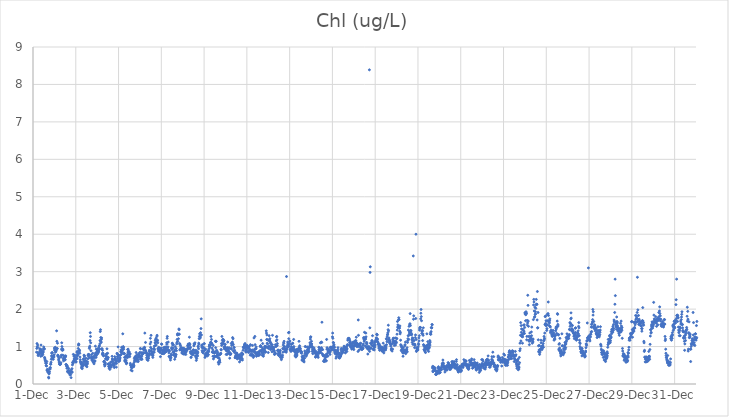
| Category | Chl (ug/L) |
|---|---|
| 44896.166666666664 | 0.85 |
| 44896.177083333336 | 0.95 |
| 44896.1875 | 1.08 |
| 44896.197916666664 | 0.99 |
| 44896.208333333336 | 0.98 |
| 44896.21875 | 1.04 |
| 44896.229166666664 | 0.84 |
| 44896.239583333336 | 0.76 |
| 44896.25 | 0.78 |
| 44896.260416666664 | 0.79 |
| 44896.270833333336 | 0.82 |
| 44896.28125 | 0.81 |
| 44896.291666666664 | 0.8 |
| 44896.302083333336 | 0.84 |
| 44896.3125 | 0.94 |
| 44896.322916666664 | 0.82 |
| 44896.333333333336 | 0.89 |
| 44896.34375 | 0.92 |
| 44896.354166666664 | 0.93 |
| 44896.364583333336 | 0.74 |
| 44896.375 | 1.04 |
| 44896.385416666664 | 0.86 |
| 44896.395833333336 | 0.9 |
| 44896.40625 | 0.8 |
| 44896.416666666664 | 0.8 |
| 44896.427083333336 | 0.76 |
| 44896.4375 | 0.85 |
| 44896.447916666664 | 0.83 |
| 44896.458333333336 | 0.79 |
| 44896.46875 | 0.87 |
| 44896.479166666664 | 0.85 |
| 44896.489583333336 | 0.93 |
| 44896.5 | 0.99 |
| 44896.510416666664 | 0.95 |
| 44896.520833333336 | 0.95 |
| 44896.53125 | 0.93 |
| 44896.541666666664 | 0.71 |
| 44896.552083333336 | 0.69 |
| 44896.5625 | 0.66 |
| 44896.572916666664 | 0.63 |
| 44896.583333333336 | 0.61 |
| 44896.59375 | 0.56 |
| 44896.604166666664 | 0.56 |
| 44896.614583333336 | 0.49 |
| 44896.625 | 0.55 |
| 44896.635416666664 | 0.48 |
| 44896.645833333336 | 0.6 |
| 44896.65625 | 0.36 |
| 44896.666666666664 | 0.39 |
| 44896.677083333336 | 0.38 |
| 44896.6875 | 0.36 |
| 44896.697916666664 | 0.32 |
| 44896.708333333336 | 0.31 |
| 44896.71875 | 0.34 |
| 44896.729166666664 | 0.18 |
| 44896.739583333336 | 0.16 |
| 44896.75 | 0.27 |
| 44896.760416666664 | 0.29 |
| 44896.770833333336 | 0.33 |
| 44896.78125 | 0.41 |
| 44896.791666666664 | 0.43 |
| 44896.802083333336 | 0.4 |
| 44896.8125 | 0.44 |
| 44896.822916666664 | 0.53 |
| 44896.833333333336 | 0.53 |
| 44896.84375 | 0.58 |
| 44896.854166666664 | 0.66 |
| 44896.864583333336 | 0.75 |
| 44896.875 | 0.83 |
| 44896.885416666664 | 0.82 |
| 44896.895833333336 | 0.71 |
| 44896.90625 | 0.84 |
| 44896.916666666664 | 0.67 |
| 44896.927083333336 | 0.7 |
| 44896.9375 | 0.73 |
| 44896.947916666664 | 0.66 |
| 44896.958333333336 | 0.76 |
| 44896.96875 | 0.74 |
| 44896.979166666664 | 0.72 |
| 44896.989583333336 | 0.78 |
| 44897.0 | 0.96 |
| 44897.010416666664 | 0.9 |
| 44897.020833333336 | 0.93 |
| 44897.03125 | 0.94 |
| 44897.041666666664 | 0.98 |
| 44897.052083333336 | 0.85 |
| 44897.0625 | 0.91 |
| 44897.072916666664 | 0.87 |
| 44897.083333333336 | 0.9 |
| 44897.09375 | 0.95 |
| 44897.104166666664 | 1.42 |
| 44897.114583333336 | 1.14 |
| 44897.125 | 0.94 |
| 44897.135416666664 | 0.95 |
| 44897.145833333336 | 1.09 |
| 44897.15625 | 0.77 |
| 44897.166666666664 | 0.74 |
| 44897.177083333336 | 0.76 |
| 44897.1875 | 0.73 |
| 44897.197916666664 | 0.66 |
| 44897.208333333336 | 0.62 |
| 44897.21875 | 0.69 |
| 44897.229166666664 | 0.58 |
| 44897.239583333336 | 0.53 |
| 44897.25 | 0.54 |
| 44897.260416666664 | 0.53 |
| 44897.270833333336 | 0.52 |
| 44897.28125 | 0.53 |
| 44897.291666666664 | 0.54 |
| 44897.302083333336 | 0.57 |
| 44897.3125 | 0.72 |
| 44897.322916666664 | 0.77 |
| 44897.333333333336 | 0.93 |
| 44897.34375 | 1.1 |
| 44897.354166666664 | 1 |
| 44897.364583333336 | 0.9 |
| 44897.375 | 0.91 |
| 44897.385416666664 | 0.94 |
| 44897.395833333336 | 0.77 |
| 44897.40625 | 0.91 |
| 44897.416666666664 | 0.68 |
| 44897.427083333336 | 0.62 |
| 44897.4375 | 0.66 |
| 44897.447916666664 | 0.71 |
| 44897.458333333336 | 0.74 |
| 44897.46875 | 0.66 |
| 44897.479166666664 | 0.64 |
| 44897.489583333336 | 0.71 |
| 44897.5 | 0.75 |
| 44897.510416666664 | 0.65 |
| 44897.520833333336 | 0.73 |
| 44897.53125 | 0.75 |
| 44897.541666666664 | 0.52 |
| 44897.552083333336 | 0.52 |
| 44897.5625 | 0.51 |
| 44897.572916666664 | 0.47 |
| 44897.583333333336 | 0.42 |
| 44897.59375 | 0.49 |
| 44897.604166666664 | 0.47 |
| 44897.614583333336 | 0.34 |
| 44897.625 | 0.32 |
| 44897.635416666664 | 0.33 |
| 44897.645833333336 | 0.42 |
| 44897.65625 | 0.42 |
| 44897.666666666664 | 0.37 |
| 44897.677083333336 | 0.33 |
| 44897.6875 | 0.33 |
| 44897.697916666664 | 0.28 |
| 44897.708333333336 | 0.32 |
| 44897.71875 | 0.28 |
| 44897.729166666664 | 0.24 |
| 44897.739583333336 | 0.33 |
| 44897.75 | 0.32 |
| 44897.760416666664 | 0.25 |
| 44897.770833333336 | 0.32 |
| 44897.78125 | 0.17 |
| 44897.791666666664 | 0.38 |
| 44897.802083333336 | 0.33 |
| 44897.8125 | 0.31 |
| 44897.822916666664 | 0.41 |
| 44897.833333333336 | 0.32 |
| 44897.84375 | 0.51 |
| 44897.854166666664 | 0.58 |
| 44897.864583333336 | 0.57 |
| 44897.875 | 0.55 |
| 44897.885416666664 | 0.79 |
| 44897.895833333336 | 0.59 |
| 44897.90625 | 0.63 |
| 44897.916666666664 | 0.74 |
| 44897.927083333336 | 0.67 |
| 44897.9375 | 0.63 |
| 44897.947916666664 | 0.67 |
| 44897.958333333336 | 0.77 |
| 44897.96875 | 0.71 |
| 44897.979166666664 | 0.67 |
| 44897.989583333336 | 0.61 |
| 44898.0 | 0.59 |
| 44898.010416666664 | 0.68 |
| 44898.020833333336 | 0.59 |
| 44898.03125 | 0.68 |
| 44898.041666666664 | 0.75 |
| 44898.052083333336 | 0.85 |
| 44898.0625 | 0.68 |
| 44898.072916666664 | 0.87 |
| 44898.083333333336 | 0.79 |
| 44898.09375 | 0.76 |
| 44898.104166666664 | 0.82 |
| 44898.114583333336 | 0.95 |
| 44898.125 | 1.04 |
| 44898.135416666664 | 1.07 |
| 44898.145833333336 | 1.05 |
| 44898.15625 | 0.86 |
| 44898.166666666664 | 0.91 |
| 44898.177083333336 | 0.89 |
| 44898.1875 | 0.82 |
| 44898.197916666664 | 0.72 |
| 44898.208333333336 | 0.65 |
| 44898.21875 | 0.6 |
| 44898.229166666664 | 0.58 |
| 44898.239583333336 | 0.55 |
| 44898.25 | 0.58 |
| 44898.260416666664 | 0.52 |
| 44898.270833333336 | 0.43 |
| 44898.28125 | 0.47 |
| 44898.291666666664 | 0.44 |
| 44898.302083333336 | 0.41 |
| 44898.3125 | 0.49 |
| 44898.322916666664 | 0.48 |
| 44898.333333333336 | 0.56 |
| 44898.34375 | 0.52 |
| 44898.354166666664 | 0.66 |
| 44898.364583333336 | 0.61 |
| 44898.375 | 0.68 |
| 44898.385416666664 | 0.77 |
| 44898.395833333336 | 0.75 |
| 44898.40625 | 0.75 |
| 44898.416666666664 | 0.6 |
| 44898.427083333336 | 0.51 |
| 44898.4375 | 0.55 |
| 44898.447916666664 | 0.63 |
| 44898.458333333336 | 0.61 |
| 44898.46875 | 0.69 |
| 44898.479166666664 | 0.61 |
| 44898.489583333336 | 0.48 |
| 44898.5 | 0.6 |
| 44898.510416666664 | 0.52 |
| 44898.520833333336 | 0.46 |
| 44898.53125 | 0.54 |
| 44898.541666666664 | 0.54 |
| 44898.552083333336 | 0.59 |
| 44898.5625 | 0.67 |
| 44898.572916666664 | 0.76 |
| 44898.583333333336 | 0.79 |
| 44898.59375 | 0.77 |
| 44898.604166666664 | 0.75 |
| 44898.614583333336 | 0.79 |
| 44898.625 | 0.7 |
| 44898.635416666664 | 0.95 |
| 44898.645833333336 | 0.98 |
| 44898.65625 | 1.01 |
| 44898.666666666664 | 1.16 |
| 44898.677083333336 | 1.37 |
| 44898.6875 | 1.27 |
| 44898.697916666664 | 1.1 |
| 44898.708333333336 | 0.89 |
| 44898.71875 | 0.72 |
| 44898.729166666664 | 0.78 |
| 44898.739583333336 | 0.68 |
| 44898.75 | 0.64 |
| 44898.760416666664 | 0.7 |
| 44898.770833333336 | 0.67 |
| 44898.78125 | 0.72 |
| 44898.791666666664 | 0.82 |
| 44898.802083333336 | 0.6 |
| 44898.8125 | 0.71 |
| 44898.822916666664 | 0.58 |
| 44898.833333333336 | 0.62 |
| 44898.84375 | 0.62 |
| 44898.854166666664 | 0.54 |
| 44898.864583333336 | 0.75 |
| 44898.875 | 0.7 |
| 44898.885416666664 | 0.6 |
| 44898.895833333336 | 0.62 |
| 44898.90625 | 0.79 |
| 44898.916666666664 | 1.01 |
| 44898.927083333336 | 0.83 |
| 44898.9375 | 0.78 |
| 44898.947916666664 | 0.71 |
| 44898.958333333336 | 0.93 |
| 44898.96875 | 0.76 |
| 44898.979166666664 | 0.84 |
| 44898.989583333336 | 0.83 |
| 44899.0 | 0.88 |
| 44899.010416666664 | 0.94 |
| 44899.020833333336 | 0.9 |
| 44899.03125 | 0.81 |
| 44899.041666666664 | 0.84 |
| 44899.052083333336 | 0.85 |
| 44899.0625 | 0.87 |
| 44899.072916666664 | 0.88 |
| 44899.083333333336 | 0.96 |
| 44899.09375 | 1.01 |
| 44899.104166666664 | 1.02 |
| 44899.114583333336 | 0.93 |
| 44899.125 | 1.07 |
| 44899.135416666664 | 1.16 |
| 44899.145833333336 | 1.4 |
| 44899.15625 | 1.45 |
| 44899.166666666664 | 1.24 |
| 44899.177083333336 | 1.13 |
| 44899.1875 | 1.11 |
| 44899.197916666664 | 1.19 |
| 44899.208333333336 | 1.23 |
| 44899.21875 | 0.94 |
| 44899.229166666664 | 0.94 |
| 44899.239583333336 | 0.8 |
| 44899.25 | 0.9 |
| 44899.260416666664 | 0.83 |
| 44899.270833333336 | 0.77 |
| 44899.28125 | 0.81 |
| 44899.291666666664 | 0.77 |
| 44899.302083333336 | 0.75 |
| 44899.3125 | 0.59 |
| 44899.322916666664 | 0.6 |
| 44899.333333333336 | 0.61 |
| 44899.34375 | 0.52 |
| 44899.354166666664 | 0.48 |
| 44899.364583333336 | 0.53 |
| 44899.375 | 0.51 |
| 44899.385416666664 | 0.56 |
| 44899.395833333336 | 0.67 |
| 44899.40625 | 0.68 |
| 44899.416666666664 | 0.79 |
| 44899.427083333336 | 0.74 |
| 44899.4375 | 0.74 |
| 44899.447916666664 | 0.81 |
| 44899.458333333336 | 0.94 |
| 44899.46875 | 0.65 |
| 44899.479166666664 | 0.69 |
| 44899.489583333336 | 0.82 |
| 44899.5 | 0.67 |
| 44899.510416666664 | 0.53 |
| 44899.520833333336 | 0.71 |
| 44899.53125 | 0.54 |
| 44899.541666666664 | 0.47 |
| 44899.552083333336 | 0.47 |
| 44899.5625 | 0.42 |
| 44899.572916666664 | 0.44 |
| 44899.583333333336 | 0.46 |
| 44899.59375 | 0.39 |
| 44899.604166666664 | 0.48 |
| 44899.614583333336 | 0.53 |
| 44899.625 | 0.58 |
| 44899.635416666664 | 0.48 |
| 44899.645833333336 | 0.49 |
| 44899.65625 | 0.45 |
| 44899.666666666664 | 0.5 |
| 44899.677083333336 | 0.49 |
| 44899.6875 | 0.6 |
| 44899.697916666664 | 0.74 |
| 44899.708333333336 | 0.67 |
| 44899.71875 | 0.66 |
| 44899.729166666664 | 0.53 |
| 44899.739583333336 | 0.61 |
| 44899.75 | 0.55 |
| 44899.760416666664 | 0.53 |
| 44899.770833333336 | 0.49 |
| 44899.78125 | 0.5 |
| 44899.791666666664 | 0.5 |
| 44899.802083333336 | 0.44 |
| 44899.8125 | 0.55 |
| 44899.822916666664 | 0.73 |
| 44899.833333333336 | 0.66 |
| 44899.84375 | 0.63 |
| 44899.854166666664 | 0.68 |
| 44899.864583333336 | 0.55 |
| 44899.875 | 0.58 |
| 44899.885416666664 | 0.62 |
| 44899.895833333336 | 0.45 |
| 44899.90625 | 0.55 |
| 44899.916666666664 | 0.62 |
| 44899.927083333336 | 0.82 |
| 44899.9375 | 0.8 |
| 44899.947916666664 | 0.73 |
| 44899.958333333336 | 0.67 |
| 44899.96875 | 0.72 |
| 44899.979166666664 | 0.99 |
| 44899.989583333336 | 0.78 |
| 44900.0 | 0.77 |
| 44900.010416666664 | 0.6 |
| 44900.020833333336 | 0.62 |
| 44900.03125 | 0.76 |
| 44900.041666666664 | 0.66 |
| 44900.052083333336 | 0.62 |
| 44900.0625 | 0.67 |
| 44900.072916666664 | 0.7 |
| 44900.083333333336 | 0.77 |
| 44900.09375 | 0.77 |
| 44900.104166666664 | 0.86 |
| 44900.114583333336 | 0.91 |
| 44900.125 | 0.86 |
| 44900.135416666664 | 0.85 |
| 44900.145833333336 | 0.98 |
| 44900.15625 | 0.81 |
| 44900.166666666664 | 0.9 |
| 44900.177083333336 | 0.88 |
| 44900.1875 | 0.96 |
| 44900.197916666664 | 1.34 |
| 44900.208333333336 | 0.97 |
| 44900.21875 | 1 |
| 44900.229166666664 | 0.98 |
| 44900.239583333336 | 0.93 |
| 44900.25 | 0.81 |
| 44900.260416666664 | 0.82 |
| 44900.270833333336 | 0.81 |
| 44900.28125 | 0.71 |
| 44900.291666666664 | 0.62 |
| 44900.302083333336 | 0.61 |
| 44900.3125 | 0.65 |
| 44900.322916666664 | 0.72 |
| 44900.333333333336 | 0.59 |
| 44900.34375 | 0.75 |
| 44900.354166666664 | 0.62 |
| 44900.364583333336 | 0.54 |
| 44900.375 | 0.56 |
| 44900.385416666664 | 0.56 |
| 44900.395833333336 | 0.74 |
| 44900.40625 | 0.7 |
| 44900.416666666664 | 0.79 |
| 44900.427083333336 | 0.92 |
| 44900.4375 | 0.85 |
| 44900.447916666664 | 0.93 |
| 44900.458333333336 | 0.73 |
| 44900.46875 | 0.85 |
| 44900.479166666664 | 0.87 |
| 44900.489583333336 | 0.86 |
| 44900.5 | 0.82 |
| 44900.510416666664 | 0.78 |
| 44900.520833333336 | 0.73 |
| 44900.53125 | 0.81 |
| 44900.541666666664 | 0.8 |
| 44900.552083333336 | 0.55 |
| 44900.5625 | 0.51 |
| 44900.572916666664 | 0.49 |
| 44900.583333333336 | 0.37 |
| 44900.59375 | 0.45 |
| 44900.604166666664 | 0.48 |
| 44900.614583333336 | 0.43 |
| 44900.625 | 0.44 |
| 44900.635416666664 | 0.35 |
| 44900.645833333336 | 0.49 |
| 44900.65625 | 0.47 |
| 44900.666666666664 | 0.48 |
| 44900.677083333336 | 0.48 |
| 44900.6875 | 0.52 |
| 44900.697916666664 | 0.53 |
| 44900.708333333336 | 0.46 |
| 44900.71875 | 0.49 |
| 44900.729166666664 | 0.58 |
| 44900.739583333336 | 0.68 |
| 44900.75 | 0.63 |
| 44900.760416666664 | 0.71 |
| 44900.770833333336 | 0.72 |
| 44900.78125 | 0.72 |
| 44900.791666666664 | 0.65 |
| 44900.802083333336 | 0.62 |
| 44900.8125 | 0.75 |
| 44900.822916666664 | 0.84 |
| 44900.833333333336 | 0.68 |
| 44900.84375 | 0.61 |
| 44900.854166666664 | 0.7 |
| 44900.864583333336 | 0.69 |
| 44900.875 | 0.78 |
| 44900.885416666664 | 0.66 |
| 44900.895833333336 | 0.63 |
| 44900.90625 | 0.61 |
| 44900.916666666664 | 0.6 |
| 44900.927083333336 | 0.72 |
| 44900.9375 | 0.74 |
| 44900.947916666664 | 0.72 |
| 44900.958333333336 | 0.81 |
| 44900.96875 | 0.76 |
| 44900.979166666664 | 0.77 |
| 44900.989583333336 | 0.84 |
| 44901.0 | 0.74 |
| 44901.010416666664 | 0.66 |
| 44901.020833333336 | 0.95 |
| 44901.03125 | 0.94 |
| 44901.041666666664 | 0.7 |
| 44901.052083333336 | 0.84 |
| 44901.0625 | 0.69 |
| 44901.072916666664 | 0.66 |
| 44901.083333333336 | 0.74 |
| 44901.09375 | 0.66 |
| 44901.104166666664 | 0.79 |
| 44901.114583333336 | 0.79 |
| 44901.125 | 0.81 |
| 44901.135416666664 | 0.94 |
| 44901.145833333336 | 0.84 |
| 44901.15625 | 0.82 |
| 44901.166666666664 | 0.93 |
| 44901.177083333336 | 0.92 |
| 44901.1875 | 0.94 |
| 44901.197916666664 | 0.91 |
| 44901.208333333336 | 0.98 |
| 44901.21875 | 0.97 |
| 44901.229166666664 | 1.36 |
| 44901.239583333336 | 0.83 |
| 44901.25 | 0.91 |
| 44901.260416666664 | 1.11 |
| 44901.270833333336 | 0.88 |
| 44901.28125 | 0.86 |
| 44901.291666666664 | 0.83 |
| 44901.302083333336 | 0.83 |
| 44901.3125 | 0.7 |
| 44901.322916666664 | 0.77 |
| 44901.333333333336 | 0.65 |
| 44901.34375 | 0.76 |
| 44901.354166666664 | 0.8 |
| 44901.364583333336 | 0.72 |
| 44901.375 | 0.63 |
| 44901.385416666664 | 0.76 |
| 44901.395833333336 | 0.68 |
| 44901.40625 | 0.69 |
| 44901.416666666664 | 0.75 |
| 44901.427083333336 | 0.81 |
| 44901.4375 | 0.9 |
| 44901.447916666664 | 0.86 |
| 44901.458333333336 | 0.87 |
| 44901.46875 | 0.79 |
| 44901.479166666664 | 1.07 |
| 44901.489583333336 | 1.22 |
| 44901.5 | 0.98 |
| 44901.510416666664 | 1.12 |
| 44901.520833333336 | 1.3 |
| 44901.53125 | 0.89 |
| 44901.541666666664 | 0.94 |
| 44901.552083333336 | 0.81 |
| 44901.5625 | 0.82 |
| 44901.572916666664 | 0.85 |
| 44901.583333333336 | 0.76 |
| 44901.59375 | 0.78 |
| 44901.604166666664 | 0.71 |
| 44901.614583333336 | 0.77 |
| 44901.625 | 0.85 |
| 44901.635416666664 | 0.85 |
| 44901.645833333336 | 0.93 |
| 44901.65625 | 0.95 |
| 44901.666666666664 | 0.85 |
| 44901.677083333336 | 1.01 |
| 44901.6875 | 0.92 |
| 44901.697916666664 | 1.02 |
| 44901.708333333336 | 1.1 |
| 44901.71875 | 1.16 |
| 44901.729166666664 | 1.1 |
| 44901.739583333336 | 1.19 |
| 44901.75 | 1.22 |
| 44901.760416666664 | 1.04 |
| 44901.770833333336 | 1.15 |
| 44901.78125 | 1.14 |
| 44901.791666666664 | 1.27 |
| 44901.802083333336 | 1.3 |
| 44901.8125 | 1.15 |
| 44901.822916666664 | 1.17 |
| 44901.833333333336 | 1.1 |
| 44901.84375 | 0.94 |
| 44901.854166666664 | 0.94 |
| 44901.864583333336 | 0.88 |
| 44901.875 | 0.98 |
| 44901.885416666664 | 0.92 |
| 44901.895833333336 | 0.9 |
| 44901.90625 | 0.96 |
| 44901.916666666664 | 0.88 |
| 44901.927083333336 | 0.86 |
| 44901.9375 | 0.86 |
| 44901.947916666664 | 0.84 |
| 44901.958333333336 | 0.73 |
| 44901.96875 | 0.94 |
| 44901.979166666664 | 0.9 |
| 44901.989583333336 | 0.96 |
| 44902.0 | 0.92 |
| 44902.010416666664 | 1.07 |
| 44902.020833333336 | 1.06 |
| 44902.03125 | 0.81 |
| 44902.041666666664 | 0.9 |
| 44902.052083333336 | 0.82 |
| 44902.0625 | 0.82 |
| 44902.072916666664 | 0.87 |
| 44902.083333333336 | 0.89 |
| 44902.09375 | 0.9 |
| 44902.104166666664 | 0.97 |
| 44902.114583333336 | 0.81 |
| 44902.125 | 0.92 |
| 44902.135416666664 | 0.89 |
| 44902.145833333336 | 0.83 |
| 44902.15625 | 0.98 |
| 44902.166666666664 | 0.85 |
| 44902.177083333336 | 0.92 |
| 44902.1875 | 0.95 |
| 44902.197916666664 | 0.98 |
| 44902.208333333336 | 0.86 |
| 44902.21875 | 0.99 |
| 44902.229166666664 | 0.92 |
| 44902.239583333336 | 0.87 |
| 44902.25 | 1.1 |
| 44902.260416666664 | 1.06 |
| 44902.270833333336 | 1.22 |
| 44902.28125 | 1.27 |
| 44902.291666666664 | 0.97 |
| 44902.302083333336 | 0.91 |
| 44902.3125 | 0.99 |
| 44902.322916666664 | 1.12 |
| 44902.333333333336 | 0.91 |
| 44902.34375 | 0.9 |
| 44902.354166666664 | 0.83 |
| 44902.364583333336 | 0.74 |
| 44902.375 | 0.73 |
| 44902.385416666664 | 0.88 |
| 44902.395833333336 | 0.73 |
| 44902.40625 | 0.73 |
| 44902.416666666664 | 0.69 |
| 44902.427083333336 | 0.64 |
| 44902.4375 | 0.71 |
| 44902.447916666664 | 0.7 |
| 44902.458333333336 | 0.8 |
| 44902.46875 | 0.77 |
| 44902.479166666664 | 0.95 |
| 44902.489583333336 | 0.97 |
| 44902.5 | 0.92 |
| 44902.510416666664 | 1.09 |
| 44902.520833333336 | 1.08 |
| 44902.53125 | 1.04 |
| 44902.541666666664 | 0.85 |
| 44902.552083333336 | 0.96 |
| 44902.5625 | 1.05 |
| 44902.572916666664 | 0.77 |
| 44902.583333333336 | 0.79 |
| 44902.59375 | 0.86 |
| 44902.604166666664 | 0.87 |
| 44902.614583333336 | 0.81 |
| 44902.625 | 0.66 |
| 44902.635416666664 | 0.91 |
| 44902.645833333336 | 1 |
| 44902.65625 | 0.72 |
| 44902.666666666664 | 0.74 |
| 44902.677083333336 | 0.79 |
| 44902.6875 | 0.78 |
| 44902.697916666664 | 0.95 |
| 44902.708333333336 | 0.89 |
| 44902.71875 | 1.07 |
| 44902.729166666664 | 1.11 |
| 44902.739583333336 | 1.19 |
| 44902.75 | 1.31 |
| 44902.760416666664 | 1.34 |
| 44902.770833333336 | 1.14 |
| 44902.78125 | 1.33 |
| 44902.791666666664 | 1.32 |
| 44902.802083333336 | 1.21 |
| 44902.8125 | 1.33 |
| 44902.822916666664 | 1.47 |
| 44902.833333333336 | 1.45 |
| 44902.84375 | 1.33 |
| 44902.854166666664 | 1.08 |
| 44902.864583333336 | 0.91 |
| 44902.875 | 1.06 |
| 44902.885416666664 | 0.92 |
| 44902.895833333336 | 1.02 |
| 44902.90625 | 0.96 |
| 44902.916666666664 | 0.94 |
| 44902.927083333336 | 0.91 |
| 44902.9375 | 0.97 |
| 44902.947916666664 | 0.9 |
| 44902.958333333336 | 0.83 |
| 44902.96875 | 0.89 |
| 44902.979166666664 | 0.95 |
| 44902.989583333336 | 0.82 |
| 44903.0 | 0.88 |
| 44903.010416666664 | 0.96 |
| 44903.020833333336 | 0.92 |
| 44903.03125 | 0.8 |
| 44903.041666666664 | 0.9 |
| 44903.052083333336 | 0.89 |
| 44903.0625 | 0.95 |
| 44903.072916666664 | 0.87 |
| 44903.083333333336 | 0.8 |
| 44903.09375 | 0.85 |
| 44903.104166666664 | 0.91 |
| 44903.114583333336 | 0.87 |
| 44903.125 | 0.84 |
| 44903.135416666664 | 0.87 |
| 44903.145833333336 | 0.79 |
| 44903.15625 | 0.93 |
| 44903.166666666664 | 0.86 |
| 44903.177083333336 | 0.91 |
| 44903.1875 | 0.91 |
| 44903.197916666664 | 0.92 |
| 44903.208333333336 | 0.91 |
| 44903.21875 | 0.93 |
| 44903.229166666664 | 1.03 |
| 44903.239583333336 | 0.96 |
| 44903.25 | 1 |
| 44903.260416666664 | 1.07 |
| 44903.270833333336 | 1.04 |
| 44903.28125 | 0.96 |
| 44903.291666666664 | 0.97 |
| 44903.302083333336 | 1.04 |
| 44903.3125 | 1.25 |
| 44903.322916666664 | 1.08 |
| 44903.333333333336 | 1.05 |
| 44903.34375 | 0.94 |
| 44903.354166666664 | 0.86 |
| 44903.364583333336 | 0.98 |
| 44903.375 | 0.82 |
| 44903.385416666664 | 0.71 |
| 44903.395833333336 | 0.72 |
| 44903.40625 | 0.87 |
| 44903.416666666664 | 0.82 |
| 44903.427083333336 | 0.85 |
| 44903.4375 | 0.79 |
| 44903.447916666664 | 0.84 |
| 44903.458333333336 | 0.82 |
| 44903.46875 | 0.82 |
| 44903.479166666664 | 0.78 |
| 44903.489583333336 | 0.91 |
| 44903.5 | 0.89 |
| 44903.510416666664 | 0.91 |
| 44903.520833333336 | 1.02 |
| 44903.53125 | 1.07 |
| 44903.541666666664 | 1.07 |
| 44903.552083333336 | 1.06 |
| 44903.5625 | 0.83 |
| 44903.572916666664 | 1.1 |
| 44903.583333333336 | 0.85 |
| 44903.59375 | 0.75 |
| 44903.604166666664 | 0.83 |
| 44903.614583333336 | 0.9 |
| 44903.625 | 0.71 |
| 44903.635416666664 | 0.63 |
| 44903.645833333336 | 0.75 |
| 44903.65625 | 0.68 |
| 44903.666666666664 | 0.87 |
| 44903.677083333336 | 0.8 |
| 44903.6875 | 0.82 |
| 44903.697916666664 | 0.75 |
| 44903.708333333336 | 0.85 |
| 44903.71875 | 1.01 |
| 44903.729166666664 | 0.99 |
| 44903.739583333336 | 0.94 |
| 44903.75 | 1.09 |
| 44903.760416666664 | 1.06 |
| 44903.770833333336 | 1.21 |
| 44903.78125 | 1.27 |
| 44903.791666666664 | 1.34 |
| 44903.802083333336 | 1.22 |
| 44903.8125 | 1.27 |
| 44903.822916666664 | 1.24 |
| 44903.833333333336 | 1.37 |
| 44903.84375 | 1.31 |
| 44903.854166666664 | 1.48 |
| 44903.864583333336 | 1.74 |
| 44903.875 | 1.31 |
| 44903.885416666664 | 1.02 |
| 44903.895833333336 | 0.98 |
| 44903.90625 | 0.89 |
| 44903.916666666664 | 1.05 |
| 44903.927083333336 | 0.85 |
| 44903.9375 | 0.96 |
| 44903.947916666664 | 0.88 |
| 44903.958333333336 | 0.83 |
| 44903.96875 | 0.98 |
| 44903.979166666664 | 0.96 |
| 44903.989583333336 | 0.88 |
| 44904.0 | 1.07 |
| 44904.010416666664 | 1.08 |
| 44904.020833333336 | 0.95 |
| 44904.03125 | 0.9 |
| 44904.041666666664 | 0.71 |
| 44904.052083333336 | 0.79 |
| 44904.0625 | 0.75 |
| 44904.072916666664 | 0.93 |
| 44904.083333333336 | 0.82 |
| 44904.09375 | 0.79 |
| 44904.104166666664 | 0.76 |
| 44904.114583333336 | 0.77 |
| 44904.125 | 0.78 |
| 44904.135416666664 | 0.82 |
| 44904.145833333336 | 0.85 |
| 44904.15625 | 0.75 |
| 44904.166666666664 | 0.8 |
| 44904.177083333336 | 0.89 |
| 44904.1875 | 0.79 |
| 44904.197916666664 | 0.78 |
| 44904.208333333336 | 0.86 |
| 44904.21875 | 0.88 |
| 44904.229166666664 | 0.94 |
| 44904.239583333336 | 1.01 |
| 44904.25 | 1.05 |
| 44904.260416666664 | 1.01 |
| 44904.270833333336 | 0.98 |
| 44904.28125 | 1.03 |
| 44904.291666666664 | 1.04 |
| 44904.302083333336 | 1.11 |
| 44904.3125 | 1.11 |
| 44904.322916666664 | 1.27 |
| 44904.333333333336 | 1.1 |
| 44904.34375 | 1.19 |
| 44904.354166666664 | 1.08 |
| 44904.364583333336 | 1.07 |
| 44904.375 | 0.96 |
| 44904.385416666664 | 0.85 |
| 44904.395833333336 | 0.85 |
| 44904.40625 | 0.91 |
| 44904.416666666664 | 0.74 |
| 44904.427083333336 | 1.03 |
| 44904.4375 | 0.67 |
| 44904.447916666664 | 0.84 |
| 44904.458333333336 | 0.86 |
| 44904.46875 | 0.74 |
| 44904.479166666664 | 0.82 |
| 44904.489583333336 | 0.72 |
| 44904.5 | 0.85 |
| 44904.510416666664 | 0.74 |
| 44904.520833333336 | 0.85 |
| 44904.53125 | 1.14 |
| 44904.541666666664 | 0.97 |
| 44904.552083333336 | 1.14 |
| 44904.5625 | 1.14 |
| 44904.572916666664 | 0.75 |
| 44904.583333333336 | 0.9 |
| 44904.59375 | 0.73 |
| 44904.604166666664 | 0.88 |
| 44904.614583333336 | 0.82 |
| 44904.625 | 0.79 |
| 44904.635416666664 | 0.76 |
| 44904.645833333336 | 0.84 |
| 44904.65625 | 0.7 |
| 44904.666666666664 | 0.58 |
| 44904.677083333336 | 0.57 |
| 44904.6875 | 0.53 |
| 44904.697916666664 | 0.77 |
| 44904.708333333336 | 0.69 |
| 44904.71875 | 0.62 |
| 44904.729166666664 | 0.64 |
| 44904.739583333336 | 0.58 |
| 44904.75 | 0.79 |
| 44904.760416666664 | 0.8 |
| 44904.770833333336 | 0.81 |
| 44904.78125 | 0.82 |
| 44904.791666666664 | 0.92 |
| 44904.802083333336 | 0.91 |
| 44904.8125 | 1.08 |
| 44904.822916666664 | 1.03 |
| 44904.833333333336 | 1.27 |
| 44904.84375 | 1.07 |
| 44904.854166666664 | 1.16 |
| 44904.864583333336 | 1.08 |
| 44904.875 | 1.19 |
| 44904.885416666664 | 1.09 |
| 44904.895833333336 | 1.19 |
| 44904.90625 | 1.13 |
| 44904.916666666664 | 1.07 |
| 44904.927083333336 | 1.16 |
| 44904.9375 | 0.97 |
| 44904.947916666664 | 0.94 |
| 44904.958333333336 | 0.99 |
| 44904.96875 | 0.99 |
| 44904.979166666664 | 1 |
| 44904.989583333336 | 1.06 |
| 44905.0 | 0.93 |
| 44905.010416666664 | 0.92 |
| 44905.020833333336 | 0.95 |
| 44905.03125 | 0.79 |
| 44905.041666666664 | 0.92 |
| 44905.052083333336 | 0.88 |
| 44905.0625 | 0.89 |
| 44905.072916666664 | 0.79 |
| 44905.083333333336 | 0.95 |
| 44905.09375 | 0.97 |
| 44905.104166666664 | 1.12 |
| 44905.114583333336 | 0.94 |
| 44905.125 | 0.82 |
| 44905.135416666664 | 0.89 |
| 44905.145833333336 | 0.92 |
| 44905.15625 | 0.83 |
| 44905.166666666664 | 0.97 |
| 44905.177083333336 | 0.83 |
| 44905.1875 | 0.85 |
| 44905.197916666664 | 0.69 |
| 44905.208333333336 | 0.79 |
| 44905.21875 | 0.82 |
| 44905.229166666664 | 0.8 |
| 44905.239583333336 | 0.79 |
| 44905.25 | 0.81 |
| 44905.260416666664 | 0.95 |
| 44905.270833333336 | 1.08 |
| 44905.28125 | 0.93 |
| 44905.291666666664 | 1.03 |
| 44905.302083333336 | 1.1 |
| 44905.3125 | 1.08 |
| 44905.322916666664 | 1.12 |
| 44905.333333333336 | 1.24 |
| 44905.34375 | 1.07 |
| 44905.354166666664 | 1.21 |
| 44905.364583333336 | 1.05 |
| 44905.375 | 0.89 |
| 44905.385416666664 | 0.87 |
| 44905.395833333336 | 0.98 |
| 44905.40625 | 0.97 |
| 44905.416666666664 | 0.87 |
| 44905.427083333336 | 0.9 |
| 44905.4375 | 0.83 |
| 44905.447916666664 | 0.7 |
| 44905.458333333336 | 0.72 |
| 44905.46875 | 0.71 |
| 44905.479166666664 | 0.76 |
| 44905.489583333336 | 0.73 |
| 44905.5 | 0.75 |
| 44905.510416666664 | 0.8 |
| 44905.520833333336 | 0.83 |
| 44905.53125 | 0.76 |
| 44905.541666666664 | 0.81 |
| 44905.552083333336 | 0.67 |
| 44905.5625 | 0.7 |
| 44905.572916666664 | 0.7 |
| 44905.583333333336 | 0.76 |
| 44905.59375 | 0.75 |
| 44905.604166666664 | 0.72 |
| 44905.614583333336 | 0.75 |
| 44905.625 | 0.71 |
| 44905.635416666664 | 0.77 |
| 44905.645833333336 | 0.68 |
| 44905.65625 | 0.59 |
| 44905.666666666664 | 0.78 |
| 44905.677083333336 | 0.75 |
| 44905.6875 | 0.7 |
| 44905.697916666664 | 0.7 |
| 44905.708333333336 | 0.64 |
| 44905.71875 | 0.7 |
| 44905.729166666664 | 0.72 |
| 44905.739583333336 | 0.74 |
| 44905.75 | 0.81 |
| 44905.760416666664 | 0.83 |
| 44905.770833333336 | 0.77 |
| 44905.78125 | 0.68 |
| 44905.791666666664 | 0.64 |
| 44905.802083333336 | 0.8 |
| 44905.8125 | 0.8 |
| 44905.822916666664 | 0.9 |
| 44905.833333333336 | 0.97 |
| 44905.84375 | 0.98 |
| 44905.854166666664 | 0.99 |
| 44905.864583333336 | 1 |
| 44905.875 | 0.97 |
| 44905.885416666664 | 1.04 |
| 44905.895833333336 | 1.06 |
| 44905.90625 | 0.97 |
| 44905.916666666664 | 1.08 |
| 44905.927083333336 | 1.01 |
| 44905.9375 | 0.88 |
| 44905.947916666664 | 0.92 |
| 44905.958333333336 | 0.85 |
| 44905.96875 | 0.99 |
| 44905.979166666664 | 0.92 |
| 44905.989583333336 | 0.99 |
| 44906.0 | 1.02 |
| 44906.010416666664 | 1.03 |
| 44906.020833333336 | 0.98 |
| 44906.03125 | 0.98 |
| 44906.041666666664 | 0.87 |
| 44906.052083333336 | 0.99 |
| 44906.0625 | 0.95 |
| 44906.072916666664 | 0.97 |
| 44906.083333333336 | 0.84 |
| 44906.09375 | 0.99 |
| 44906.104166666664 | 0.96 |
| 44906.114583333336 | 1.01 |
| 44906.125 | 0.89 |
| 44906.135416666664 | 0.88 |
| 44906.145833333336 | 0.92 |
| 44906.15625 | 0.77 |
| 44906.166666666664 | 1.05 |
| 44906.177083333336 | 0.88 |
| 44906.1875 | 0.8 |
| 44906.197916666664 | 0.88 |
| 44906.208333333336 | 0.89 |
| 44906.21875 | 0.87 |
| 44906.229166666664 | 0.76 |
| 44906.239583333336 | 0.78 |
| 44906.25 | 0.91 |
| 44906.260416666664 | 1.03 |
| 44906.270833333336 | 0.79 |
| 44906.28125 | 0.87 |
| 44906.291666666664 | 0.88 |
| 44906.302083333336 | 0.71 |
| 44906.3125 | 0.75 |
| 44906.322916666664 | 0.75 |
| 44906.333333333336 | 1.23 |
| 44906.34375 | 0.86 |
| 44906.354166666664 | 0.91 |
| 44906.364583333336 | 0.93 |
| 44906.375 | 1.27 |
| 44906.385416666664 | 1.05 |
| 44906.395833333336 | 0.85 |
| 44906.40625 | 0.81 |
| 44906.416666666664 | 0.95 |
| 44906.427083333336 | 0.94 |
| 44906.4375 | 0.99 |
| 44906.447916666664 | 0.74 |
| 44906.458333333336 | 0.77 |
| 44906.46875 | 0.79 |
| 44906.479166666664 | 0.84 |
| 44906.489583333336 | 0.82 |
| 44906.5 | 0.78 |
| 44906.510416666664 | 0.83 |
| 44906.520833333336 | 0.79 |
| 44906.53125 | 0.76 |
| 44906.541666666664 | 0.83 |
| 44906.552083333336 | 0.78 |
| 44906.5625 | 0.86 |
| 44906.572916666664 | 0.77 |
| 44906.583333333336 | 0.78 |
| 44906.59375 | 0.8 |
| 44906.604166666664 | 0.87 |
| 44906.614583333336 | 0.89 |
| 44906.625 | 1 |
| 44906.635416666664 | 1.02 |
| 44906.645833333336 | 1.02 |
| 44906.65625 | 1 |
| 44906.666666666664 | 1.17 |
| 44906.677083333336 | 0.9 |
| 44906.6875 | 0.86 |
| 44906.697916666664 | 0.9 |
| 44906.708333333336 | 0.83 |
| 44906.71875 | 0.77 |
| 44906.729166666664 | 0.96 |
| 44906.739583333336 | 1.08 |
| 44906.75 | 0.91 |
| 44906.760416666664 | 0.76 |
| 44906.770833333336 | 0.74 |
| 44906.78125 | 0.8 |
| 44906.791666666664 | 0.85 |
| 44906.802083333336 | 0.88 |
| 44906.8125 | 0.94 |
| 44906.822916666664 | 0.91 |
| 44906.833333333336 | 0.99 |
| 44906.84375 | 1.01 |
| 44906.854166666664 | 0.86 |
| 44906.864583333336 | 0.87 |
| 44906.875 | 0.85 |
| 44906.885416666664 | 0.97 |
| 44906.895833333336 | 1 |
| 44906.90625 | 1.42 |
| 44906.916666666664 | 1.36 |
| 44906.927083333336 | 1.19 |
| 44906.9375 | 1.31 |
| 44906.947916666664 | 1.09 |
| 44906.958333333336 | 1.18 |
| 44906.96875 | 1.07 |
| 44906.979166666664 | 0.99 |
| 44906.989583333336 | 0.97 |
| 44907.0 | 0.84 |
| 44907.010416666664 | 0.95 |
| 44907.020833333336 | 1 |
| 44907.03125 | 1.16 |
| 44907.041666666664 | 1.29 |
| 44907.052083333336 | 1.17 |
| 44907.0625 | 1.01 |
| 44907.072916666664 | 1.21 |
| 44907.083333333336 | 1.14 |
| 44907.09375 | 1.1 |
| 44907.104166666664 | 0.92 |
| 44907.114583333336 | 1.1 |
| 44907.125 | 0.96 |
| 44907.135416666664 | 0.93 |
| 44907.145833333336 | 1.05 |
| 44907.15625 | 0.97 |
| 44907.166666666664 | 1 |
| 44907.177083333336 | 0.86 |
| 44907.1875 | 1.05 |
| 44907.197916666664 | 1.3 |
| 44907.208333333336 | 0.93 |
| 44907.21875 | 0.98 |
| 44907.229166666664 | 0.98 |
| 44907.239583333336 | 0.94 |
| 44907.25 | 0.91 |
| 44907.260416666664 | 0.97 |
| 44907.270833333336 | 0.87 |
| 44907.28125 | 0.89 |
| 44907.291666666664 | 0.79 |
| 44907.302083333336 | 0.8 |
| 44907.3125 | 0.83 |
| 44907.322916666664 | 0.82 |
| 44907.333333333336 | 1.05 |
| 44907.34375 | 0.81 |
| 44907.354166666664 | 1.01 |
| 44907.364583333336 | 1 |
| 44907.375 | 1.15 |
| 44907.385416666664 | 1.26 |
| 44907.395833333336 | 1.27 |
| 44907.40625 | 1.18 |
| 44907.416666666664 | 1.03 |
| 44907.427083333336 | 1.08 |
| 44907.4375 | 0.89 |
| 44907.447916666664 | 0.89 |
| 44907.458333333336 | 0.91 |
| 44907.46875 | 0.8 |
| 44907.479166666664 | 0.77 |
| 44907.489583333336 | 0.83 |
| 44907.5 | 0.76 |
| 44907.510416666664 | 0.84 |
| 44907.520833333336 | 0.87 |
| 44907.53125 | 0.81 |
| 44907.541666666664 | 0.87 |
| 44907.552083333336 | 0.82 |
| 44907.5625 | 0.9 |
| 44907.572916666664 | 0.71 |
| 44907.583333333336 | 0.76 |
| 44907.59375 | 0.71 |
| 44907.604166666664 | 0.73 |
| 44907.614583333336 | 0.65 |
| 44907.625 | 0.73 |
| 44907.635416666664 | 0.75 |
| 44907.645833333336 | 0.74 |
| 44907.65625 | 0.71 |
| 44907.666666666664 | 0.77 |
| 44907.677083333336 | 0.95 |
| 44907.6875 | 0.85 |
| 44907.697916666664 | 1.04 |
| 44907.708333333336 | 0.93 |
| 44907.71875 | 1.1 |
| 44907.729166666664 | 1.09 |
| 44907.739583333336 | 1.14 |
| 44907.75 | 0.99 |
| 44907.760416666664 | 1 |
| 44907.770833333336 | 0.95 |
| 44907.78125 | 0.87 |
| 44907.791666666664 | 0.93 |
| 44907.802083333336 | 0.87 |
| 44907.8125 | 0.93 |
| 44907.822916666664 | 0.89 |
| 44907.833333333336 | 0.85 |
| 44907.84375 | 0.86 |
| 44907.854166666664 | 2.87 |
| 44907.864583333336 | 0.92 |
| 44907.875 | 0.94 |
| 44907.885416666664 | 1.02 |
| 44907.895833333336 | 0.98 |
| 44907.90625 | 1.12 |
| 44907.916666666664 | 1.07 |
| 44907.927083333336 | 1.05 |
| 44907.9375 | 1 |
| 44907.947916666664 | 1.37 |
| 44907.958333333336 | 1.21 |
| 44907.96875 | 1.38 |
| 44907.979166666664 | 1.01 |
| 44907.989583333336 | 1.07 |
| 44908.0 | 1.13 |
| 44908.010416666664 | 1.15 |
| 44908.020833333336 | 0.91 |
| 44908.03125 | 0.91 |
| 44908.041666666664 | 0.95 |
| 44908.052083333336 | 0.9 |
| 44908.0625 | 0.87 |
| 44908.072916666664 | 1.06 |
| 44908.083333333336 | 1 |
| 44908.09375 | 0.92 |
| 44908.104166666664 | 0.94 |
| 44908.114583333336 | 0.9 |
| 44908.125 | 0.96 |
| 44908.135416666664 | 1.08 |
| 44908.145833333336 | 1.09 |
| 44908.15625 | 0.9 |
| 44908.166666666664 | 0.93 |
| 44908.177083333336 | 0.97 |
| 44908.1875 | 1.19 |
| 44908.197916666664 | 1 |
| 44908.208333333336 | 0.89 |
| 44908.21875 | 0.92 |
| 44908.229166666664 | 0.87 |
| 44908.239583333336 | 0.86 |
| 44908.25 | 0.75 |
| 44908.260416666664 | 0.88 |
| 44908.270833333336 | 0.79 |
| 44908.28125 | 0.83 |
| 44908.291666666664 | 0.72 |
| 44908.302083333336 | 0.91 |
| 44908.3125 | 0.92 |
| 44908.322916666664 | 0.75 |
| 44908.333333333336 | 0.76 |
| 44908.34375 | 0.8 |
| 44908.354166666664 | 0.85 |
| 44908.364583333336 | 0.9 |
| 44908.375 | 0.86 |
| 44908.385416666664 | 0.92 |
| 44908.395833333336 | 0.9 |
| 44908.40625 | 0.94 |
| 44908.416666666664 | 0.94 |
| 44908.427083333336 | 0.89 |
| 44908.4375 | 1.14 |
| 44908.447916666664 | 0.98 |
| 44908.458333333336 | 0.93 |
| 44908.46875 | 1.02 |
| 44908.479166666664 | 0.94 |
| 44908.489583333336 | 0.92 |
| 44908.5 | 0.95 |
| 44908.510416666664 | 0.87 |
| 44908.520833333336 | 0.88 |
| 44908.53125 | 0.84 |
| 44908.541666666664 | 0.87 |
| 44908.552083333336 | 0.82 |
| 44908.5625 | 0.85 |
| 44908.572916666664 | 0.64 |
| 44908.583333333336 | 0.73 |
| 44908.59375 | 0.64 |
| 44908.604166666664 | 0.7 |
| 44908.614583333336 | 0.75 |
| 44908.625 | 0.69 |
| 44908.635416666664 | 0.61 |
| 44908.645833333336 | 0.67 |
| 44908.65625 | 0.63 |
| 44908.666666666664 | 0.68 |
| 44908.677083333336 | 0.59 |
| 44908.6875 | 0.76 |
| 44908.697916666664 | 0.69 |
| 44908.708333333336 | 0.88 |
| 44908.71875 | 0.82 |
| 44908.729166666664 | 1 |
| 44908.739583333336 | 1 |
| 44908.75 | 0.82 |
| 44908.760416666664 | 0.82 |
| 44908.770833333336 | 0.74 |
| 44908.78125 | 0.82 |
| 44908.791666666664 | 0.81 |
| 44908.802083333336 | 0.78 |
| 44908.8125 | 0.86 |
| 44908.822916666664 | 0.99 |
| 44908.833333333336 | 0.92 |
| 44908.84375 | 0.9 |
| 44908.854166666664 | 0.89 |
| 44908.864583333336 | 0.84 |
| 44908.875 | 0.95 |
| 44908.885416666664 | 0.92 |
| 44908.895833333336 | 0.96 |
| 44908.90625 | 0.87 |
| 44908.916666666664 | 0.97 |
| 44908.927083333336 | 0.98 |
| 44908.9375 | 1.01 |
| 44908.947916666664 | 1.1 |
| 44908.958333333336 | 1.04 |
| 44908.96875 | 1.2 |
| 44908.979166666664 | 1.25 |
| 44908.989583333336 | 1.26 |
| 44909.0 | 1.02 |
| 44909.010416666664 | 1.07 |
| 44909.020833333336 | 1.14 |
| 44909.03125 | 1.07 |
| 44909.041666666664 | 0.98 |
| 44909.052083333336 | 0.87 |
| 44909.0625 | 1 |
| 44909.072916666664 | 0.93 |
| 44909.083333333336 | 0.81 |
| 44909.09375 | 0.91 |
| 44909.104166666664 | 0.87 |
| 44909.114583333336 | 0.9 |
| 44909.125 | 0.88 |
| 44909.135416666664 | 0.92 |
| 44909.145833333336 | 0.96 |
| 44909.15625 | 0.91 |
| 44909.166666666664 | 0.87 |
| 44909.177083333336 | 0.85 |
| 44909.1875 | 0.82 |
| 44909.197916666664 | 0.85 |
| 44909.208333333336 | 0.72 |
| 44909.21875 | 0.72 |
| 44909.229166666664 | 0.87 |
| 44909.239583333336 | 0.76 |
| 44909.25 | 0.79 |
| 44909.260416666664 | 0.82 |
| 44909.270833333336 | 0.78 |
| 44909.28125 | 0.77 |
| 44909.291666666664 | 0.83 |
| 44909.302083333336 | 0.83 |
| 44909.3125 | 0.74 |
| 44909.322916666664 | 0.75 |
| 44909.333333333336 | 0.71 |
| 44909.34375 | 0.84 |
| 44909.354166666664 | 0.81 |
| 44909.364583333336 | 0.98 |
| 44909.375 | 0.92 |
| 44909.385416666664 | 0.9 |
| 44909.395833333336 | 0.85 |
| 44909.40625 | 0.86 |
| 44909.416666666664 | 0.96 |
| 44909.427083333336 | 0.93 |
| 44909.4375 | 1.1 |
| 44909.447916666664 | 0.84 |
| 44909.458333333336 | 0.89 |
| 44909.46875 | 0.93 |
| 44909.479166666664 | 1.12 |
| 44909.489583333336 | 0.97 |
| 44909.5 | 1.11 |
| 44909.510416666664 | 1.65 |
| 44909.520833333336 | 0.81 |
| 44909.53125 | 0.92 |
| 44909.541666666664 | 0.92 |
| 44909.552083333336 | 0.77 |
| 44909.5625 | 0.78 |
| 44909.572916666664 | 0.75 |
| 44909.583333333336 | 0.61 |
| 44909.59375 | 0.76 |
| 44909.604166666664 | 0.76 |
| 44909.614583333336 | 0.6 |
| 44909.625 | 0.62 |
| 44909.635416666664 | 0.66 |
| 44909.645833333336 | 0.64 |
| 44909.65625 | 0.64 |
| 44909.666666666664 | 0.7 |
| 44909.677083333336 | 0.61 |
| 44909.6875 | 0.75 |
| 44909.697916666664 | 0.72 |
| 44909.708333333336 | 0.79 |
| 44909.71875 | 0.62 |
| 44909.729166666664 | 1.19 |
| 44909.739583333336 | 0.93 |
| 44909.75 | 0.97 |
| 44909.760416666664 | 0.76 |
| 44909.770833333336 | 0.82 |
| 44909.78125 | 0.74 |
| 44909.791666666664 | 0.92 |
| 44909.802083333336 | 0.87 |
| 44909.8125 | 0.86 |
| 44909.822916666664 | 0.93 |
| 44909.833333333336 | 0.9 |
| 44909.84375 | 0.9 |
| 44909.854166666664 | 0.9 |
| 44909.864583333336 | 0.88 |
| 44909.875 | 0.84 |
| 44909.885416666664 | 0.79 |
| 44909.895833333336 | 0.86 |
| 44909.90625 | 0.98 |
| 44909.916666666664 | 0.97 |
| 44909.927083333336 | 0.98 |
| 44909.9375 | 0.98 |
| 44909.947916666664 | 0.97 |
| 44909.958333333336 | 0.91 |
| 44909.96875 | 0.97 |
| 44909.979166666664 | 0.92 |
| 44909.989583333336 | 0.99 |
| 44910.0 | 1.26 |
| 44910.010416666664 | 1.36 |
| 44910.020833333336 | 1.22 |
| 44910.03125 | 0.96 |
| 44910.041666666664 | 1.11 |
| 44910.052083333336 | 1.1 |
| 44910.0625 | 1.02 |
| 44910.072916666664 | 1.05 |
| 44910.083333333336 | 0.89 |
| 44910.09375 | 0.91 |
| 44910.104166666664 | 0.98 |
| 44910.114583333336 | 0.84 |
| 44910.125 | 0.81 |
| 44910.135416666664 | 0.84 |
| 44910.145833333336 | 0.83 |
| 44910.15625 | 0.9 |
| 44910.166666666664 | 0.69 |
| 44910.177083333336 | 0.82 |
| 44910.1875 | 0.74 |
| 44910.197916666664 | 0.82 |
| 44910.208333333336 | 0.8 |
| 44910.21875 | 0.81 |
| 44910.229166666664 | 0.86 |
| 44910.239583333336 | 0.88 |
| 44910.25 | 0.91 |
| 44910.260416666664 | 0.97 |
| 44910.270833333336 | 0.78 |
| 44910.28125 | 0.83 |
| 44910.291666666664 | 0.72 |
| 44910.302083333336 | 0.71 |
| 44910.3125 | 0.72 |
| 44910.322916666664 | 0.82 |
| 44910.333333333336 | 0.69 |
| 44910.34375 | 0.73 |
| 44910.354166666664 | 0.79 |
| 44910.364583333336 | 0.73 |
| 44910.375 | 0.73 |
| 44910.385416666664 | 0.75 |
| 44910.395833333336 | 0.91 |
| 44910.40625 | 0.78 |
| 44910.416666666664 | 0.95 |
| 44910.427083333336 | 0.85 |
| 44910.4375 | 0.86 |
| 44910.447916666664 | 0.82 |
| 44910.458333333336 | 0.85 |
| 44910.46875 | 0.84 |
| 44910.479166666664 | 0.86 |
| 44910.489583333336 | 0.85 |
| 44910.5 | 0.95 |
| 44910.510416666664 | 0.91 |
| 44910.520833333336 | 0.91 |
| 44910.53125 | 0.91 |
| 44910.541666666664 | 1.01 |
| 44910.552083333336 | 0.92 |
| 44910.5625 | 0.99 |
| 44910.572916666664 | 0.91 |
| 44910.583333333336 | 0.97 |
| 44910.59375 | 0.92 |
| 44910.604166666664 | 0.83 |
| 44910.614583333336 | 0.9 |
| 44910.625 | 0.85 |
| 44910.635416666664 | 0.97 |
| 44910.645833333336 | 1 |
| 44910.65625 | 0.99 |
| 44910.666666666664 | 0.93 |
| 44910.677083333336 | 0.87 |
| 44910.6875 | 0.94 |
| 44910.697916666664 | 1.05 |
| 44910.708333333336 | 1.04 |
| 44910.71875 | 1.17 |
| 44910.729166666664 | 1.2 |
| 44910.739583333336 | 1.22 |
| 44910.75 | 1.2 |
| 44910.760416666664 | 1.21 |
| 44910.770833333336 | 1.18 |
| 44910.78125 | 1.22 |
| 44910.791666666664 | 1.19 |
| 44910.802083333336 | 1.1 |
| 44910.8125 | 1.02 |
| 44910.822916666664 | 1.04 |
| 44910.833333333336 | 1.14 |
| 44910.84375 | 1.08 |
| 44910.854166666664 | 0.99 |
| 44910.864583333336 | 1.09 |
| 44910.875 | 0.98 |
| 44910.885416666664 | 0.99 |
| 44910.895833333336 | 1.02 |
| 44910.90625 | 0.93 |
| 44910.916666666664 | 0.95 |
| 44910.927083333336 | 1.07 |
| 44910.9375 | 1.01 |
| 44910.947916666664 | 1.01 |
| 44910.958333333336 | 1.09 |
| 44910.96875 | 1.12 |
| 44910.979166666664 | 0.96 |
| 44910.989583333336 | 1.02 |
| 44911.0 | 0.92 |
| 44911.010416666664 | 1.1 |
| 44911.020833333336 | 1.13 |
| 44911.03125 | 1.01 |
| 44911.041666666664 | 1.03 |
| 44911.052083333336 | 1.06 |
| 44911.0625 | 1.09 |
| 44911.072916666664 | 1.1 |
| 44911.083333333336 | 1.16 |
| 44911.09375 | 1.05 |
| 44911.104166666664 | 1.15 |
| 44911.114583333336 | 1.25 |
| 44911.125 | 1.07 |
| 44911.135416666664 | 1 |
| 44911.145833333336 | 1.09 |
| 44911.15625 | 1.04 |
| 44911.166666666664 | 1.07 |
| 44911.177083333336 | 1.07 |
| 44911.1875 | 1 |
| 44911.197916666664 | 0.87 |
| 44911.208333333336 | 1.71 |
| 44911.21875 | 1.3 |
| 44911.229166666664 | 1.01 |
| 44911.239583333336 | 1.02 |
| 44911.25 | 0.91 |
| 44911.260416666664 | 1.04 |
| 44911.270833333336 | 1.07 |
| 44911.28125 | 1.04 |
| 44911.291666666664 | 1.07 |
| 44911.302083333336 | 1.04 |
| 44911.3125 | 0.98 |
| 44911.322916666664 | 1.09 |
| 44911.333333333336 | 0.94 |
| 44911.34375 | 0.97 |
| 44911.354166666664 | 0.98 |
| 44911.364583333336 | 0.92 |
| 44911.375 | 0.94 |
| 44911.385416666664 | 0.97 |
| 44911.395833333336 | 0.93 |
| 44911.40625 | 0.94 |
| 44911.416666666664 | 0.94 |
| 44911.427083333336 | 1.03 |
| 44911.4375 | 0.96 |
| 44911.447916666664 | 1.07 |
| 44911.458333333336 | 1.24 |
| 44911.46875 | 1.21 |
| 44911.479166666664 | 1.18 |
| 44911.489583333336 | 1.14 |
| 44911.5 | 1.38 |
| 44911.510416666664 | 1.19 |
| 44911.520833333336 | 1.24 |
| 44911.53125 | 1.02 |
| 44911.541666666664 | 1.23 |
| 44911.552083333336 | 1.2 |
| 44911.5625 | 1.36 |
| 44911.572916666664 | 1.26 |
| 44911.583333333336 | 0.98 |
| 44911.59375 | 1.09 |
| 44911.604166666664 | 1.11 |
| 44911.614583333336 | 1.07 |
| 44911.625 | 1 |
| 44911.635416666664 | 0.95 |
| 44911.645833333336 | 0.94 |
| 44911.65625 | 0.8 |
| 44911.666666666664 | 0.98 |
| 44911.677083333336 | 0.99 |
| 44911.6875 | 0.92 |
| 44911.697916666664 | 0.98 |
| 44911.708333333336 | 1 |
| 44911.71875 | 0.95 |
| 44911.729166666664 | 8.39 |
| 44911.739583333336 | 0.87 |
| 44911.75 | 1.5 |
| 44911.760416666664 | 2.98 |
| 44911.770833333336 | 3.13 |
| 44911.78125 | 1.09 |
| 44911.791666666664 | 0.95 |
| 44911.802083333336 | 0.96 |
| 44911.8125 | 1.08 |
| 44911.822916666664 | 1.09 |
| 44911.833333333336 | 1.04 |
| 44911.84375 | 1.16 |
| 44911.854166666664 | 1.14 |
| 44911.864583333336 | 1.15 |
| 44911.875 | 1.29 |
| 44911.885416666664 | 1.11 |
| 44911.895833333336 | 1.01 |
| 44911.90625 | 0.92 |
| 44911.916666666664 | 0.94 |
| 44911.927083333336 | 1.01 |
| 44911.9375 | 1.02 |
| 44911.947916666664 | 1.06 |
| 44911.958333333336 | 0.91 |
| 44911.96875 | 1.02 |
| 44911.979166666664 | 0.98 |
| 44911.989583333336 | 1.11 |
| 44912.0 | 1.04 |
| 44912.010416666664 | 1.13 |
| 44912.020833333336 | 1.17 |
| 44912.03125 | 1.14 |
| 44912.041666666664 | 1.17 |
| 44912.052083333336 | 1.23 |
| 44912.0625 | 1.22 |
| 44912.072916666664 | 1.33 |
| 44912.083333333336 | 1.32 |
| 44912.09375 | 1.31 |
| 44912.104166666664 | 1.14 |
| 44912.114583333336 | 1.2 |
| 44912.125 | 1.12 |
| 44912.135416666664 | 1.06 |
| 44912.145833333336 | 1.09 |
| 44912.15625 | 1.06 |
| 44912.166666666664 | 0.96 |
| 44912.177083333336 | 1.01 |
| 44912.1875 | 1.02 |
| 44912.197916666664 | 1.06 |
| 44912.208333333336 | 0.9 |
| 44912.21875 | 0.91 |
| 44912.229166666664 | 0.98 |
| 44912.239583333336 | 0.92 |
| 44912.25 | 0.99 |
| 44912.260416666664 | 1 |
| 44912.270833333336 | 0.93 |
| 44912.28125 | 0.94 |
| 44912.291666666664 | 0.95 |
| 44912.302083333336 | 0.9 |
| 44912.3125 | 0.94 |
| 44912.322916666664 | 0.88 |
| 44912.333333333336 | 0.98 |
| 44912.34375 | 0.87 |
| 44912.354166666664 | 0.91 |
| 44912.364583333336 | 0.96 |
| 44912.375 | 1.09 |
| 44912.385416666664 | 0.88 |
| 44912.395833333336 | 0.91 |
| 44912.40625 | 0.83 |
| 44912.416666666664 | 0.9 |
| 44912.427083333336 | 0.95 |
| 44912.4375 | 0.94 |
| 44912.447916666664 | 1.01 |
| 44912.458333333336 | 1.02 |
| 44912.46875 | 0.94 |
| 44912.479166666664 | 1.01 |
| 44912.489583333336 | 0.91 |
| 44912.5 | 0.99 |
| 44912.510416666664 | 0.96 |
| 44912.520833333336 | 1.21 |
| 44912.53125 | 1.05 |
| 44912.541666666664 | 1.19 |
| 44912.552083333336 | 1.13 |
| 44912.5625 | 1.26 |
| 44912.572916666664 | 1.31 |
| 44912.583333333336 | 1.33 |
| 44912.59375 | 1.37 |
| 44912.604166666664 | 1.45 |
| 44912.614583333336 | 1.57 |
| 44912.625 | 1.42 |
| 44912.635416666664 | 1.17 |
| 44912.645833333336 | 1.23 |
| 44912.65625 | 1.19 |
| 44912.666666666664 | 1.1 |
| 44912.677083333336 | 1.12 |
| 44912.6875 | 1.15 |
| 44912.697916666664 | 1.13 |
| 44912.708333333336 | 1.08 |
| 44912.71875 | 1.05 |
| 44912.729166666664 | 1.01 |
| 44912.739583333336 | 1.07 |
| 44912.75 | 0.91 |
| 44912.760416666664 | 0.94 |
| 44912.770833333336 | 0.94 |
| 44912.78125 | 0.93 |
| 44912.791666666664 | 0.88 |
| 44912.802083333336 | 1.08 |
| 44912.8125 | 0.93 |
| 44912.822916666664 | 1.18 |
| 44912.833333333336 | 1.12 |
| 44912.84375 | 1.22 |
| 44912.854166666664 | 1.22 |
| 44912.864583333336 | 1.14 |
| 44912.875 | 1.15 |
| 44912.885416666664 | 1.03 |
| 44912.895833333336 | 1.13 |
| 44912.90625 | 1.08 |
| 44912.916666666664 | 1.09 |
| 44912.927083333336 | 1.14 |
| 44912.9375 | 1.23 |
| 44912.947916666664 | 1.04 |
| 44912.958333333336 | 1.14 |
| 44912.96875 | 1.12 |
| 44912.979166666664 | 1.12 |
| 44912.989583333336 | 1.1 |
| 44913.0 | 1.22 |
| 44913.010416666664 | 1.21 |
| 44913.020833333336 | 1.33 |
| 44913.03125 | 1.44 |
| 44913.041666666664 | 1.67 |
| 44913.052083333336 | 1.52 |
| 44913.0625 | 1.58 |
| 44913.072916666664 | 1.5 |
| 44913.083333333336 | 1.54 |
| 44913.09375 | 1.72 |
| 44913.104166666664 | 1.77 |
| 44913.114583333336 | 1.72 |
| 44913.125 | 1.5 |
| 44913.135416666664 | 1.49 |
| 44913.145833333336 | 1.41 |
| 44913.15625 | 1.55 |
| 44913.166666666664 | 1.34 |
| 44913.177083333336 | 1.38 |
| 44913.1875 | 1.17 |
| 44913.197916666664 | 1.05 |
| 44913.208333333336 | 1.03 |
| 44913.21875 | 0.89 |
| 44913.229166666664 | 0.99 |
| 44913.239583333336 | 0.92 |
| 44913.25 | 1 |
| 44913.260416666664 | 0.96 |
| 44913.270833333336 | 0.92 |
| 44913.28125 | 0.85 |
| 44913.291666666664 | 0.83 |
| 44913.302083333336 | 0.74 |
| 44913.3125 | 0.97 |
| 44913.322916666664 | 0.84 |
| 44913.333333333336 | 0.83 |
| 44913.34375 | 0.89 |
| 44913.354166666664 | 0.88 |
| 44913.364583333336 | 0.91 |
| 44913.375 | 0.87 |
| 44913.385416666664 | 1.02 |
| 44913.395833333336 | 1.05 |
| 44913.40625 | 0.88 |
| 44913.416666666664 | 1.12 |
| 44913.427083333336 | 0.81 |
| 44913.4375 | 0.91 |
| 44913.447916666664 | 0.85 |
| 44913.458333333336 | 0.92 |
| 44913.46875 | 0.91 |
| 44913.479166666664 | 0.91 |
| 44913.489583333336 | 0.97 |
| 44913.5 | 0.86 |
| 44913.510416666664 | 1.11 |
| 44913.520833333336 | 1.16 |
| 44913.53125 | 1.21 |
| 44913.541666666664 | 1.29 |
| 44913.552083333336 | 1.44 |
| 44913.5625 | 1.19 |
| 44913.572916666664 | 1.3 |
| 44913.583333333336 | 1.54 |
| 44913.59375 | 1.39 |
| 44913.604166666664 | 1.34 |
| 44913.614583333336 | 1.59 |
| 44913.625 | 1.61 |
| 44913.635416666664 | 1.88 |
| 44913.645833333336 | 1.56 |
| 44913.65625 | 1.43 |
| 44913.666666666664 | 1.37 |
| 44913.677083333336 | 1.42 |
| 44913.6875 | 1.31 |
| 44913.697916666664 | 1.32 |
| 44913.708333333336 | 1.33 |
| 44913.71875 | 1.18 |
| 44913.729166666664 | 1.11 |
| 44913.739583333336 | 1.22 |
| 44913.75 | 1.23 |
| 44913.760416666664 | 1.06 |
| 44913.770833333336 | 1.16 |
| 44913.78125 | 3.42 |
| 44913.791666666664 | 1.73 |
| 44913.802083333336 | 1.82 |
| 44913.8125 | 1.07 |
| 44913.822916666664 | 1.16 |
| 44913.833333333336 | 1.05 |
| 44913.84375 | 0.97 |
| 44913.854166666664 | 1.06 |
| 44913.864583333336 | 1.03 |
| 44913.875 | 1.24 |
| 44913.885416666664 | 1.31 |
| 44913.895833333336 | 1.75 |
| 44913.90625 | 4 |
| 44913.916666666664 | 1.19 |
| 44913.927083333336 | 0.87 |
| 44913.9375 | 0.89 |
| 44913.947916666664 | 0.95 |
| 44913.958333333336 | 0.93 |
| 44913.96875 | 0.98 |
| 44913.979166666664 | 0.91 |
| 44913.989583333336 | 0.94 |
| 44914.0 | 0.91 |
| 44914.010416666664 | 0.99 |
| 44914.020833333336 | 1.08 |
| 44914.03125 | 1.05 |
| 44914.041666666664 | 1.23 |
| 44914.052083333336 | 1.15 |
| 44914.0625 | 1.29 |
| 44914.072916666664 | 1.44 |
| 44914.083333333336 | 1.48 |
| 44914.09375 | 1.51 |
| 44914.104166666664 | 1.51 |
| 44914.114583333336 | 1.51 |
| 44914.125 | 1.74 |
| 44914.135416666664 | 1.89 |
| 44914.145833333336 | 1.99 |
| 44914.15625 | 1.8 |
| 44914.166666666664 | 1.69 |
| 44914.177083333336 | 1.35 |
| 44914.1875 | 1.4 |
| 44914.197916666664 | 1.43 |
| 44914.208333333336 | 1.42 |
| 44914.21875 | 1.16 |
| 44914.229166666664 | 1.34 |
| 44914.239583333336 | 1.3 |
| 44914.25 | 1.5 |
| 44914.260416666664 | 1.05 |
| 44914.270833333336 | 1.04 |
| 44914.28125 | 0.92 |
| 44914.291666666664 | 1 |
| 44914.302083333336 | 0.91 |
| 44914.3125 | 0.92 |
| 44914.322916666664 | 0.88 |
| 44914.333333333336 | 0.86 |
| 44914.34375 | 0.98 |
| 44914.354166666664 | 0.84 |
| 44914.364583333336 | 0.93 |
| 44914.375 | 0.96 |
| 44914.385416666664 | 1.02 |
| 44914.395833333336 | 1.01 |
| 44914.40625 | 1 |
| 44914.416666666664 | 1.34 |
| 44914.427083333336 | 0.95 |
| 44914.4375 | 1.03 |
| 44914.447916666664 | 0.91 |
| 44914.458333333336 | 1.13 |
| 44914.46875 | 0.97 |
| 44914.479166666664 | 1.06 |
| 44914.489583333336 | 0.94 |
| 44914.5 | 0.87 |
| 44914.510416666664 | 0.96 |
| 44914.520833333336 | 1 |
| 44914.53125 | 0.97 |
| 44914.541666666664 | 1.09 |
| 44914.552083333336 | 1.16 |
| 44914.5625 | 1.04 |
| 44914.572916666664 | 1.12 |
| 44914.583333333336 | 1.33 |
| 44914.59375 | 1.37 |
| 44914.604166666664 | 1.33 |
| 44914.614583333336 | 1.4 |
| 44914.625 | 1.51 |
| 44914.635416666664 | 1.5 |
| 44914.645833333336 | 1.5 |
| 44914.65625 | 1.59 |
| 44914.666666666664 | 1.58 |
| 44914.677083333336 | 0.43 |
| 44914.6875 | 0.47 |
| 44914.697916666664 | 0.33 |
| 44914.708333333336 | 0.36 |
| 44914.71875 | 0.34 |
| 44914.729166666664 | 0.46 |
| 44914.739583333336 | 0.44 |
| 44914.75 | 0.43 |
| 44914.760416666664 | 0.42 |
| 44914.770833333336 | 0.4 |
| 44914.78125 | 0.36 |
| 44914.791666666664 | 0.42 |
| 44914.802083333336 | 0.43 |
| 44914.8125 | 0.35 |
| 44914.822916666664 | 0.26 |
| 44914.833333333336 | 0.35 |
| 44914.84375 | 0.25 |
| 44914.854166666664 | 0.33 |
| 44914.864583333336 | 0.26 |
| 44914.875 | 0.34 |
| 44914.885416666664 | 0.29 |
| 44914.895833333336 | 0.35 |
| 44914.90625 | 0.33 |
| 44914.916666666664 | 0.28 |
| 44914.927083333336 | 0.32 |
| 44914.9375 | 0.43 |
| 44914.947916666664 | 0.3 |
| 44914.958333333336 | 0.46 |
| 44914.96875 | 0.37 |
| 44914.979166666664 | 0.42 |
| 44914.989583333336 | 0.29 |
| 44915.0 | 0.4 |
| 44915.010416666664 | 0.36 |
| 44915.020833333336 | 0.3 |
| 44915.03125 | 0.41 |
| 44915.041666666664 | 0.31 |
| 44915.052083333336 | 0.4 |
| 44915.0625 | 0.38 |
| 44915.072916666664 | 0.4 |
| 44915.083333333336 | 0.44 |
| 44915.09375 | 0.38 |
| 44915.104166666664 | 0.4 |
| 44915.114583333336 | 0.45 |
| 44915.125 | 0.5 |
| 44915.135416666664 | 0.54 |
| 44915.145833333336 | 0.51 |
| 44915.15625 | 0.56 |
| 44915.166666666664 | 0.64 |
| 44915.177083333336 | 0.56 |
| 44915.1875 | 0.55 |
| 44915.197916666664 | 0.46 |
| 44915.208333333336 | 0.46 |
| 44915.21875 | 0.49 |
| 44915.229166666664 | 0.43 |
| 44915.239583333336 | 0.39 |
| 44915.25 | 0.45 |
| 44915.260416666664 | 0.32 |
| 44915.270833333336 | 0.4 |
| 44915.28125 | 0.39 |
| 44915.291666666664 | 0.42 |
| 44915.302083333336 | 0.45 |
| 44915.3125 | 0.38 |
| 44915.322916666664 | 0.44 |
| 44915.333333333336 | 0.38 |
| 44915.34375 | 0.49 |
| 44915.354166666664 | 0.37 |
| 44915.364583333336 | 0.44 |
| 44915.375 | 0.47 |
| 44915.385416666664 | 0.46 |
| 44915.395833333336 | 0.49 |
| 44915.40625 | 0.57 |
| 44915.416666666664 | 0.48 |
| 44915.427083333336 | 0.56 |
| 44915.4375 | 0.53 |
| 44915.447916666664 | 0.43 |
| 44915.458333333336 | 0.46 |
| 44915.46875 | 0.45 |
| 44915.479166666664 | 0.39 |
| 44915.489583333336 | 0.5 |
| 44915.5 | 0.49 |
| 44915.510416666664 | 0.46 |
| 44915.520833333336 | 0.39 |
| 44915.53125 | 0.44 |
| 44915.541666666664 | 0.49 |
| 44915.552083333336 | 0.44 |
| 44915.5625 | 0.44 |
| 44915.572916666664 | 0.48 |
| 44915.583333333336 | 0.59 |
| 44915.59375 | 0.53 |
| 44915.604166666664 | 0.6 |
| 44915.614583333336 | 0.55 |
| 44915.625 | 0.45 |
| 44915.635416666664 | 0.49 |
| 44915.645833333336 | 0.51 |
| 44915.65625 | 0.51 |
| 44915.666666666664 | 0.56 |
| 44915.677083333336 | 0.53 |
| 44915.6875 | 0.6 |
| 44915.697916666664 | 0.54 |
| 44915.708333333336 | 0.54 |
| 44915.71875 | 0.43 |
| 44915.729166666664 | 0.49 |
| 44915.739583333336 | 0.43 |
| 44915.75 | 0.49 |
| 44915.760416666664 | 0.51 |
| 44915.770833333336 | 0.42 |
| 44915.78125 | 0.46 |
| 44915.791666666664 | 0.6 |
| 44915.802083333336 | 0.65 |
| 44915.8125 | 0.49 |
| 44915.822916666664 | 0.43 |
| 44915.833333333336 | 0.52 |
| 44915.84375 | 0.38 |
| 44915.854166666664 | 0.43 |
| 44915.864583333336 | 0.35 |
| 44915.875 | 0.43 |
| 44915.885416666664 | 0.32 |
| 44915.895833333336 | 0.33 |
| 44915.90625 | 0.36 |
| 44915.916666666664 | 0.38 |
| 44915.927083333336 | 0.37 |
| 44915.9375 | 0.44 |
| 44915.947916666664 | 0.47 |
| 44915.958333333336 | 0.45 |
| 44915.96875 | 0.45 |
| 44915.979166666664 | 0.46 |
| 44915.989583333336 | 0.33 |
| 44916.0 | 0.39 |
| 44916.010416666664 | 0.39 |
| 44916.020833333336 | 0.36 |
| 44916.03125 | 0.35 |
| 44916.041666666664 | 0.46 |
| 44916.052083333336 | 0.51 |
| 44916.0625 | 0.48 |
| 44916.072916666664 | 0.53 |
| 44916.083333333336 | 0.5 |
| 44916.09375 | 0.48 |
| 44916.104166666664 | 0.44 |
| 44916.114583333336 | 0.5 |
| 44916.125 | 0.49 |
| 44916.135416666664 | 0.55 |
| 44916.145833333336 | 0.65 |
| 44916.15625 | 0.52 |
| 44916.166666666664 | 0.52 |
| 44916.177083333336 | 0.51 |
| 44916.1875 | 0.6 |
| 44916.197916666664 | 0.62 |
| 44916.208333333336 | 0.51 |
| 44916.21875 | 0.55 |
| 44916.229166666664 | 0.61 |
| 44916.239583333336 | 0.62 |
| 44916.25 | 0.61 |
| 44916.260416666664 | 0.53 |
| 44916.270833333336 | 0.5 |
| 44916.28125 | 0.48 |
| 44916.291666666664 | 0.46 |
| 44916.302083333336 | 0.5 |
| 44916.3125 | 0.49 |
| 44916.322916666664 | 0.42 |
| 44916.333333333336 | 0.47 |
| 44916.34375 | 0.52 |
| 44916.354166666664 | 0.44 |
| 44916.364583333336 | 0.39 |
| 44916.375 | 0.46 |
| 44916.385416666664 | 0.42 |
| 44916.395833333336 | 0.5 |
| 44916.40625 | 0.63 |
| 44916.416666666664 | 0.5 |
| 44916.427083333336 | 0.62 |
| 44916.4375 | 0.58 |
| 44916.447916666664 | 0.59 |
| 44916.458333333336 | 0.58 |
| 44916.46875 | 0.56 |
| 44916.479166666664 | 0.53 |
| 44916.489583333336 | 0.5 |
| 44916.5 | 0.63 |
| 44916.510416666664 | 0.67 |
| 44916.520833333336 | 0.53 |
| 44916.53125 | 0.55 |
| 44916.541666666664 | 0.54 |
| 44916.552083333336 | 0.42 |
| 44916.5625 | 0.51 |
| 44916.572916666664 | 0.56 |
| 44916.583333333336 | 0.45 |
| 44916.59375 | 0.53 |
| 44916.604166666664 | 0.45 |
| 44916.614583333336 | 0.5 |
| 44916.625 | 0.65 |
| 44916.635416666664 | 0.57 |
| 44916.645833333336 | 0.53 |
| 44916.65625 | 0.48 |
| 44916.666666666664 | 0.48 |
| 44916.677083333336 | 0.57 |
| 44916.6875 | 0.54 |
| 44916.697916666664 | 0.44 |
| 44916.708333333336 | 0.4 |
| 44916.71875 | 0.54 |
| 44916.729166666664 | 0.37 |
| 44916.739583333336 | 0.51 |
| 44916.75 | 0.5 |
| 44916.760416666664 | 0.4 |
| 44916.770833333336 | 0.56 |
| 44916.78125 | 0.51 |
| 44916.791666666664 | 0.48 |
| 44916.802083333336 | 0.44 |
| 44916.8125 | 0.42 |
| 44916.822916666664 | 0.46 |
| 44916.833333333336 | 0.45 |
| 44916.84375 | 0.45 |
| 44916.854166666664 | 0.44 |
| 44916.864583333336 | 0.31 |
| 44916.875 | 0.52 |
| 44916.885416666664 | 0.38 |
| 44916.895833333336 | 0.37 |
| 44916.90625 | 0.36 |
| 44916.916666666664 | 0.47 |
| 44916.927083333336 | 0.36 |
| 44916.9375 | 0.41 |
| 44916.947916666664 | 0.47 |
| 44916.958333333336 | 0.46 |
| 44916.96875 | 0.52 |
| 44916.979166666664 | 0.65 |
| 44916.989583333336 | 0.48 |
| 44917.0 | 0.55 |
| 44917.010416666664 | 0.52 |
| 44917.020833333336 | 0.65 |
| 44917.03125 | 0.5 |
| 44917.041666666664 | 0.48 |
| 44917.052083333336 | 0.61 |
| 44917.0625 | 0.43 |
| 44917.072916666664 | 0.5 |
| 44917.083333333336 | 0.52 |
| 44917.09375 | 0.5 |
| 44917.104166666664 | 0.51 |
| 44917.114583333336 | 0.41 |
| 44917.125 | 0.55 |
| 44917.135416666664 | 0.51 |
| 44917.145833333336 | 0.4 |
| 44917.15625 | 0.5 |
| 44917.166666666664 | 0.45 |
| 44917.177083333336 | 0.58 |
| 44917.1875 | 0.55 |
| 44917.197916666664 | 0.64 |
| 44917.208333333336 | 0.51 |
| 44917.21875 | 0.61 |
| 44917.229166666664 | 0.65 |
| 44917.239583333336 | 0.66 |
| 44917.25 | 0.66 |
| 44917.260416666664 | 0.52 |
| 44917.270833333336 | 0.55 |
| 44917.28125 | 0.75 |
| 44917.291666666664 | 0.57 |
| 44917.302083333336 | 0.54 |
| 44917.3125 | 0.63 |
| 44917.322916666664 | 0.55 |
| 44917.333333333336 | 0.51 |
| 44917.34375 | 0.45 |
| 44917.354166666664 | 0.52 |
| 44917.364583333336 | 0.57 |
| 44917.375 | 0.45 |
| 44917.385416666664 | 0.51 |
| 44917.395833333336 | 0.49 |
| 44917.40625 | 0.53 |
| 44917.416666666664 | 0.54 |
| 44917.427083333336 | 0.59 |
| 44917.4375 | 0.55 |
| 44917.447916666664 | 0.66 |
| 44917.458333333336 | 0.73 |
| 44917.46875 | 0.59 |
| 44917.479166666664 | 0.64 |
| 44917.489583333336 | 0.62 |
| 44917.5 | 0.85 |
| 44917.510416666664 | 0.56 |
| 44917.520833333336 | 0.53 |
| 44917.53125 | 0.57 |
| 44917.541666666664 | 0.73 |
| 44917.552083333336 | 0.56 |
| 44917.5625 | 0.47 |
| 44917.572916666664 | 0.52 |
| 44917.583333333336 | 0.47 |
| 44917.59375 | 0.5 |
| 44917.604166666664 | 0.45 |
| 44917.614583333336 | 0.45 |
| 44917.625 | 0.39 |
| 44917.635416666664 | 0.48 |
| 44917.645833333336 | 0.38 |
| 44917.65625 | 0.43 |
| 44917.666666666664 | 0.41 |
| 44917.677083333336 | 0.35 |
| 44917.6875 | 0.41 |
| 44917.697916666664 | 0.38 |
| 44917.708333333336 | 0.49 |
| 44917.71875 | 0.46 |
| 44917.729166666664 | 0.49 |
| 44917.739583333336 | 0.72 |
| 44917.75 | 0.75 |
| 44917.760416666664 | 0.65 |
| 44917.770833333336 | 0.64 |
| 44917.78125 | 0.66 |
| 44917.791666666664 | 0.68 |
| 44917.802083333336 | 0.71 |
| 44917.8125 | 0.65 |
| 44917.822916666664 | 0.68 |
| 44917.833333333336 | 0.66 |
| 44917.84375 | 0.69 |
| 44917.854166666664 | 0.63 |
| 44917.864583333336 | 0.58 |
| 44917.875 | 0.63 |
| 44917.885416666664 | 0.62 |
| 44917.895833333336 | 0.61 |
| 44917.90625 | 0.61 |
| 44917.916666666664 | 0.48 |
| 44917.927083333336 | 0.63 |
| 44917.9375 | 0.58 |
| 44917.947916666664 | 0.71 |
| 44917.958333333336 | 0.65 |
| 44917.96875 | 0.65 |
| 44917.979166666664 | 0.61 |
| 44917.989583333336 | 0.64 |
| 44918.0 | 0.64 |
| 44918.010416666664 | 0.8 |
| 44918.020833333336 | 0.66 |
| 44918.03125 | 0.59 |
| 44918.041666666664 | 0.66 |
| 44918.052083333336 | 0.77 |
| 44918.0625 | 0.55 |
| 44918.072916666664 | 0.58 |
| 44918.083333333336 | 0.63 |
| 44918.09375 | 0.5 |
| 44918.104166666664 | 0.65 |
| 44918.114583333336 | 0.55 |
| 44918.125 | 0.5 |
| 44918.135416666664 | 0.61 |
| 44918.145833333336 | 0.56 |
| 44918.15625 | 0.55 |
| 44918.166666666664 | 0.64 |
| 44918.177083333336 | 0.55 |
| 44918.1875 | 0.5 |
| 44918.197916666664 | 0.58 |
| 44918.208333333336 | 0.62 |
| 44918.21875 | 0.72 |
| 44918.229166666664 | 0.72 |
| 44918.239583333336 | 0.78 |
| 44918.25 | 0.66 |
| 44918.260416666664 | 0.85 |
| 44918.270833333336 | 0.77 |
| 44918.28125 | 0.89 |
| 44918.291666666664 | 0.86 |
| 44918.302083333336 | 0.77 |
| 44918.3125 | 0.68 |
| 44918.322916666664 | 0.84 |
| 44918.333333333336 | 0.82 |
| 44918.34375 | 0.68 |
| 44918.354166666664 | 0.74 |
| 44918.364583333336 | 0.76 |
| 44918.375 | 0.73 |
| 44918.385416666664 | 0.68 |
| 44918.395833333336 | 0.76 |
| 44918.40625 | 0.87 |
| 44918.416666666664 | 0.89 |
| 44918.427083333336 | 0.83 |
| 44918.4375 | 0.86 |
| 44918.447916666664 | 0.87 |
| 44918.458333333336 | 0.76 |
| 44918.46875 | 0.78 |
| 44918.479166666664 | 0.74 |
| 44918.489583333336 | 0.76 |
| 44918.5 | 0.6 |
| 44918.510416666664 | 0.69 |
| 44918.520833333336 | 0.67 |
| 44918.53125 | 0.77 |
| 44918.541666666664 | 0.65 |
| 44918.552083333336 | 0.87 |
| 44918.5625 | 0.75 |
| 44918.572916666664 | 0.64 |
| 44918.583333333336 | 0.78 |
| 44918.59375 | 0.57 |
| 44918.604166666664 | 0.53 |
| 44918.614583333336 | 0.48 |
| 44918.625 | 0.42 |
| 44918.635416666664 | 0.63 |
| 44918.645833333336 | 0.62 |
| 44918.65625 | 0.61 |
| 44918.666666666664 | 0.52 |
| 44918.677083333336 | 0.66 |
| 44918.6875 | 0.38 |
| 44918.697916666664 | 0.45 |
| 44918.708333333336 | 0.52 |
| 44918.71875 | 0.4 |
| 44918.729166666664 | 0.45 |
| 44918.739583333336 | 0.71 |
| 44918.75 | 0.57 |
| 44918.760416666664 | 0.89 |
| 44918.770833333336 | 1.09 |
| 44918.78125 | 0.94 |
| 44918.791666666664 | 1.3 |
| 44918.802083333336 | 1.64 |
| 44918.8125 | 1.15 |
| 44918.822916666664 | 1.56 |
| 44918.833333333336 | 1.38 |
| 44918.84375 | 1.47 |
| 44918.854166666664 | 1.27 |
| 44918.864583333336 | 1.32 |
| 44918.875 | 1.3 |
| 44918.885416666664 | 1.09 |
| 44918.895833333336 | 1.26 |
| 44918.90625 | 1.46 |
| 44918.916666666664 | 1.44 |
| 44918.927083333336 | 1.34 |
| 44918.9375 | 1.57 |
| 44918.947916666664 | 1.36 |
| 44918.958333333336 | 1.41 |
| 44918.96875 | 1.58 |
| 44918.979166666664 | 1.35 |
| 44918.989583333336 | 1.51 |
| 44919.0 | 1.9 |
| 44919.010416666664 | 1.87 |
| 44919.020833333336 | 1.9 |
| 44919.03125 | 1.69 |
| 44919.041666666664 | 1.85 |
| 44919.052083333336 | 1.93 |
| 44919.0625 | 1.9 |
| 44919.072916666664 | 1.88 |
| 44919.083333333336 | 1.18 |
| 44919.09375 | 1.27 |
| 44919.104166666664 | 1.7 |
| 44919.114583333336 | 1.57 |
| 44919.125 | 1.63 |
| 44919.135416666664 | 2.37 |
| 44919.145833333336 | 2.1 |
| 44919.15625 | 1.68 |
| 44919.166666666664 | 1.54 |
| 44919.177083333336 | 1.27 |
| 44919.1875 | 1.17 |
| 44919.197916666664 | 1.14 |
| 44919.208333333336 | 1.05 |
| 44919.21875 | 1.18 |
| 44919.229166666664 | 1.36 |
| 44919.239583333336 | 1.27 |
| 44919.25 | 1.15 |
| 44919.260416666664 | 1.2 |
| 44919.270833333336 | 1.19 |
| 44919.28125 | 1.24 |
| 44919.291666666664 | 1.21 |
| 44919.302083333336 | 1.39 |
| 44919.3125 | 1.29 |
| 44919.322916666664 | 1.52 |
| 44919.333333333336 | 1.19 |
| 44919.34375 | 1.09 |
| 44919.354166666664 | 1.18 |
| 44919.364583333336 | 1.14 |
| 44919.375 | 1.12 |
| 44919.385416666664 | 1.2 |
| 44919.395833333336 | 1.72 |
| 44919.40625 | 2.11 |
| 44919.416666666664 | 2.26 |
| 44919.427083333336 | 2.19 |
| 44919.4375 | 1.95 |
| 44919.447916666664 | 1.78 |
| 44919.458333333336 | 1.8 |
| 44919.46875 | 2.05 |
| 44919.479166666664 | 1.86 |
| 44919.489583333336 | 1.93 |
| 44919.5 | 1.87 |
| 44919.510416666664 | 2.02 |
| 44919.520833333336 | 2.12 |
| 44919.53125 | 2.26 |
| 44919.541666666664 | 2.12 |
| 44919.552083333336 | 2.13 |
| 44919.5625 | 2.13 |
| 44919.572916666664 | 1.71 |
| 44919.583333333336 | 2.47 |
| 44919.59375 | 1.5 |
| 44919.604166666664 | 1.5 |
| 44919.614583333336 | 1.91 |
| 44919.625 | 1.18 |
| 44919.635416666664 | 1.02 |
| 44919.645833333336 | 0.87 |
| 44919.65625 | 0.85 |
| 44919.666666666664 | 0.91 |
| 44919.677083333336 | 1.03 |
| 44919.6875 | 0.79 |
| 44919.697916666664 | 0.84 |
| 44919.708333333336 | 0.88 |
| 44919.71875 | 0.92 |
| 44919.729166666664 | 0.92 |
| 44919.739583333336 | 0.94 |
| 44919.75 | 1.17 |
| 44919.760416666664 | 1.1 |
| 44919.770833333336 | 1 |
| 44919.78125 | 0.95 |
| 44919.791666666664 | 0.99 |
| 44919.802083333336 | 0.92 |
| 44919.8125 | 0.98 |
| 44919.822916666664 | 1.01 |
| 44919.833333333336 | 1.03 |
| 44919.84375 | 0.98 |
| 44919.854166666664 | 1.08 |
| 44919.864583333336 | 0.98 |
| 44919.875 | 1.15 |
| 44919.885416666664 | 1.17 |
| 44919.895833333336 | 1.27 |
| 44919.90625 | 1.18 |
| 44919.916666666664 | 1.22 |
| 44919.927083333336 | 1.36 |
| 44919.9375 | 1.59 |
| 44919.947916666664 | 1.8 |
| 44919.958333333336 | 1.81 |
| 44919.96875 | 1.62 |
| 44919.979166666664 | 1.56 |
| 44919.989583333336 | 1.69 |
| 44920.0 | 1.58 |
| 44920.010416666664 | 1.57 |
| 44920.020833333336 | 1.43 |
| 44920.03125 | 1.48 |
| 44920.041666666664 | 1.85 |
| 44920.052083333336 | 1.58 |
| 44920.0625 | 1.69 |
| 44920.072916666664 | 1.87 |
| 44920.083333333336 | 1.88 |
| 44920.09375 | 2.19 |
| 44920.104166666664 | 1.83 |
| 44920.114583333336 | 1.69 |
| 44920.125 | 1.65 |
| 44920.135416666664 | 1.56 |
| 44920.145833333336 | 1.63 |
| 44920.15625 | 1.69 |
| 44920.166666666664 | 1.74 |
| 44920.177083333336 | 1.54 |
| 44920.1875 | 1.52 |
| 44920.197916666664 | 1.37 |
| 44920.208333333336 | 1.42 |
| 44920.21875 | 1.4 |
| 44920.229166666664 | 1.41 |
| 44920.239583333336 | 1.44 |
| 44920.25 | 1.41 |
| 44920.260416666664 | 1.32 |
| 44920.270833333336 | 1.29 |
| 44920.28125 | 1.27 |
| 44920.291666666664 | 1.33 |
| 44920.302083333336 | 1.29 |
| 44920.3125 | 1.36 |
| 44920.322916666664 | 1.43 |
| 44920.333333333336 | 1.3 |
| 44920.34375 | 1.3 |
| 44920.354166666664 | 1.36 |
| 44920.364583333336 | 1.17 |
| 44920.375 | 1.2 |
| 44920.385416666664 | 1.29 |
| 44920.395833333336 | 1.26 |
| 44920.40625 | 1.2 |
| 44920.416666666664 | 1.29 |
| 44920.427083333336 | 1.3 |
| 44920.4375 | 1.42 |
| 44920.447916666664 | 1.49 |
| 44920.458333333336 | 1.52 |
| 44920.46875 | 1.47 |
| 44920.479166666664 | 1.53 |
| 44920.489583333336 | 1.35 |
| 44920.5 | 1.52 |
| 44920.510416666664 | 1.68 |
| 44920.520833333336 | 1.88 |
| 44920.53125 | 1.86 |
| 44920.541666666664 | 1.59 |
| 44920.552083333336 | 1.55 |
| 44920.5625 | 1.31 |
| 44920.572916666664 | 1.32 |
| 44920.583333333336 | 0.93 |
| 44920.59375 | 1.06 |
| 44920.604166666664 | 0.9 |
| 44920.614583333336 | 1.08 |
| 44920.625 | 0.96 |
| 44920.635416666664 | 1.22 |
| 44920.645833333336 | 0.87 |
| 44920.65625 | 0.86 |
| 44920.666666666664 | 0.81 |
| 44920.677083333336 | 0.75 |
| 44920.6875 | 0.83 |
| 44920.697916666664 | 0.9 |
| 44920.708333333336 | 0.79 |
| 44920.71875 | 0.86 |
| 44920.729166666664 | 1.34 |
| 44920.739583333336 | 1.02 |
| 44920.75 | 0.82 |
| 44920.760416666664 | 1.02 |
| 44920.770833333336 | 0.81 |
| 44920.78125 | 0.82 |
| 44920.791666666664 | 0.78 |
| 44920.802083333336 | 0.83 |
| 44920.8125 | 0.94 |
| 44920.822916666664 | 0.91 |
| 44920.833333333336 | 0.83 |
| 44920.84375 | 0.85 |
| 44920.854166666664 | 0.99 |
| 44920.864583333336 | 1.04 |
| 44920.875 | 1.11 |
| 44920.885416666664 | 0.93 |
| 44920.895833333336 | 1.06 |
| 44920.90625 | 0.97 |
| 44920.916666666664 | 1.07 |
| 44920.927083333336 | 1.24 |
| 44920.9375 | 1.13 |
| 44920.947916666664 | 1.17 |
| 44920.958333333336 | 1.23 |
| 44920.96875 | 1.34 |
| 44920.979166666664 | 1.26 |
| 44920.989583333336 | 1.25 |
| 44921.0 | 1.27 |
| 44921.010416666664 | 1.28 |
| 44921.020833333336 | 1.21 |
| 44921.03125 | 1.22 |
| 44921.041666666664 | 1.29 |
| 44921.052083333336 | 1.22 |
| 44921.0625 | 1.29 |
| 44921.072916666664 | 1.32 |
| 44921.083333333336 | 1.46 |
| 44921.09375 | 1.45 |
| 44921.104166666664 | 1.64 |
| 44921.114583333336 | 1.54 |
| 44921.125 | 1.62 |
| 44921.135416666664 | 1.61 |
| 44921.145833333336 | 1.74 |
| 44921.15625 | 1.9 |
| 44921.166666666664 | 1.76 |
| 44921.177083333336 | 1.44 |
| 44921.1875 | 1.42 |
| 44921.197916666664 | 1.48 |
| 44921.208333333336 | 1.57 |
| 44921.21875 | 1.56 |
| 44921.229166666664 | 1.45 |
| 44921.239583333336 | 1.4 |
| 44921.25 | 1.43 |
| 44921.260416666664 | 1.37 |
| 44921.270833333336 | 1.35 |
| 44921.28125 | 1.36 |
| 44921.291666666664 | 1.28 |
| 44921.302083333336 | 1.27 |
| 44921.3125 | 1.21 |
| 44921.322916666664 | 1.3 |
| 44921.333333333336 | 1.34 |
| 44921.34375 | 1.31 |
| 44921.354166666664 | 1.49 |
| 44921.364583333336 | 1.38 |
| 44921.375 | 1.5 |
| 44921.385416666664 | 1.21 |
| 44921.395833333336 | 1.26 |
| 44921.40625 | 1.17 |
| 44921.416666666664 | 1.23 |
| 44921.427083333336 | 1.19 |
| 44921.4375 | 1.3 |
| 44921.447916666664 | 1.25 |
| 44921.458333333336 | 1.37 |
| 44921.46875 | 1.35 |
| 44921.479166666664 | 1.28 |
| 44921.489583333336 | 1.42 |
| 44921.5 | 1.34 |
| 44921.510416666664 | 1.54 |
| 44921.520833333336 | 1.64 |
| 44921.53125 | 1.5 |
| 44921.541666666664 | 1.29 |
| 44921.552083333336 | 1.17 |
| 44921.5625 | 1.11 |
| 44921.572916666664 | 1 |
| 44921.583333333336 | 1.08 |
| 44921.59375 | 0.96 |
| 44921.604166666664 | 0.93 |
| 44921.614583333336 | 0.86 |
| 44921.625 | 0.93 |
| 44921.635416666664 | 0.83 |
| 44921.645833333336 | 0.95 |
| 44921.65625 | 0.9 |
| 44921.666666666664 | 0.75 |
| 44921.677083333336 | 0.95 |
| 44921.6875 | 0.87 |
| 44921.697916666664 | 0.83 |
| 44921.708333333336 | 0.82 |
| 44921.71875 | 0.88 |
| 44921.729166666664 | 0.79 |
| 44921.739583333336 | 0.77 |
| 44921.75 | 0.81 |
| 44921.760416666664 | 0.78 |
| 44921.770833333336 | 0.77 |
| 44921.78125 | 0.81 |
| 44921.791666666664 | 0.76 |
| 44921.802083333336 | 0.72 |
| 44921.8125 | 0.77 |
| 44921.822916666664 | 0.74 |
| 44921.833333333336 | 0.85 |
| 44921.84375 | 0.88 |
| 44921.854166666664 | 0.97 |
| 44921.864583333336 | 1.07 |
| 44921.875 | 1.06 |
| 44921.885416666664 | 1.03 |
| 44921.895833333336 | 1.15 |
| 44921.90625 | 1.15 |
| 44921.916666666664 | 1.63 |
| 44921.927083333336 | 1.23 |
| 44921.9375 | 1.24 |
| 44921.947916666664 | 1.18 |
| 44921.958333333336 | 1.22 |
| 44921.96875 | 3.1 |
| 44921.979166666664 | 1.26 |
| 44921.989583333336 | 1.19 |
| 44922.0 | 1.29 |
| 44922.010416666664 | 1.19 |
| 44922.020833333336 | 1.19 |
| 44922.03125 | 1.25 |
| 44922.041666666664 | 1.15 |
| 44922.052083333336 | 1.25 |
| 44922.0625 | 1.27 |
| 44922.072916666664 | 1.33 |
| 44922.083333333336 | 1.33 |
| 44922.09375 | 1.39 |
| 44922.104166666664 | 1.52 |
| 44922.114583333336 | 1.59 |
| 44922.125 | 1.4 |
| 44922.135416666664 | 1.52 |
| 44922.145833333336 | 1.62 |
| 44922.15625 | 1.66 |
| 44922.166666666664 | 1.72 |
| 44922.177083333336 | 1.99 |
| 44922.1875 | 1.84 |
| 44922.197916666664 | 1.93 |
| 44922.208333333336 | 1.54 |
| 44922.21875 | 1.67 |
| 44922.229166666664 | 1.49 |
| 44922.239583333336 | 1.53 |
| 44922.25 | 1.5 |
| 44922.260416666664 | 1.58 |
| 44922.270833333336 | 1.57 |
| 44922.28125 | 1.46 |
| 44922.291666666664 | 1.42 |
| 44922.302083333336 | 1.51 |
| 44922.3125 | 1.48 |
| 44922.322916666664 | 1.48 |
| 44922.333333333336 | 1.34 |
| 44922.34375 | 1.37 |
| 44922.354166666664 | 1.34 |
| 44922.364583333336 | 1.31 |
| 44922.375 | 1.24 |
| 44922.385416666664 | 1.42 |
| 44922.395833333336 | 1.31 |
| 44922.40625 | 1.26 |
| 44922.416666666664 | 1.53 |
| 44922.427083333336 | 1.43 |
| 44922.4375 | 1.36 |
| 44922.447916666664 | 1.29 |
| 44922.458333333336 | 1.29 |
| 44922.46875 | 1.3 |
| 44922.479166666664 | 1.26 |
| 44922.489583333336 | 1.42 |
| 44922.5 | 1.32 |
| 44922.510416666664 | 1.38 |
| 44922.520833333336 | 1.44 |
| 44922.53125 | 1.53 |
| 44922.541666666664 | 1.06 |
| 44922.552083333336 | 1.04 |
| 44922.5625 | 1.01 |
| 44922.572916666664 | 0.93 |
| 44922.583333333336 | 0.84 |
| 44922.59375 | 0.9 |
| 44922.604166666664 | 0.79 |
| 44922.614583333336 | 0.84 |
| 44922.625 | 0.82 |
| 44922.635416666664 | 0.8 |
| 44922.645833333336 | 0.79 |
| 44922.65625 | 0.82 |
| 44922.666666666664 | 0.71 |
| 44922.677083333336 | 0.89 |
| 44922.6875 | 0.85 |
| 44922.697916666664 | 0.72 |
| 44922.708333333336 | 0.64 |
| 44922.71875 | 0.8 |
| 44922.729166666664 | 0.81 |
| 44922.739583333336 | 0.82 |
| 44922.75 | 0.74 |
| 44922.760416666664 | 0.64 |
| 44922.770833333336 | 0.6 |
| 44922.78125 | 0.72 |
| 44922.791666666664 | 0.68 |
| 44922.802083333336 | 0.67 |
| 44922.8125 | 0.72 |
| 44922.822916666664 | 0.78 |
| 44922.833333333336 | 0.7 |
| 44922.84375 | 0.86 |
| 44922.854166666664 | 0.75 |
| 44922.864583333336 | 0.82 |
| 44922.875 | 0.98 |
| 44922.885416666664 | 1.05 |
| 44922.895833333336 | 1.19 |
| 44922.90625 | 1.11 |
| 44922.916666666664 | 1.08 |
| 44922.927083333336 | 1.1 |
| 44922.9375 | 1.14 |
| 44922.947916666664 | 1.2 |
| 44922.958333333336 | 1.28 |
| 44922.96875 | 1.3 |
| 44922.979166666664 | 1.1 |
| 44922.989583333336 | 1.12 |
| 44923.0 | 1.16 |
| 44923.010416666664 | 1.23 |
| 44923.020833333336 | 1.27 |
| 44923.03125 | 1.24 |
| 44923.041666666664 | 1.4 |
| 44923.052083333336 | 1.34 |
| 44923.0625 | 1.46 |
| 44923.072916666664 | 1.39 |
| 44923.083333333336 | 1.42 |
| 44923.09375 | 1.45 |
| 44923.104166666664 | 1.38 |
| 44923.114583333336 | 1.54 |
| 44923.125 | 1.49 |
| 44923.135416666664 | 1.43 |
| 44923.145833333336 | 1.59 |
| 44923.15625 | 1.48 |
| 44923.166666666664 | 1.71 |
| 44923.177083333336 | 1.66 |
| 44923.1875 | 1.68 |
| 44923.197916666664 | 1.91 |
| 44923.208333333336 | 2.13 |
| 44923.21875 | 2.8 |
| 44923.229166666664 | 2.36 |
| 44923.239583333336 | 1.63 |
| 44923.25 | 1.55 |
| 44923.260416666664 | 1.58 |
| 44923.270833333336 | 1.52 |
| 44923.28125 | 1.46 |
| 44923.291666666664 | 1.79 |
| 44923.302083333336 | 1.67 |
| 44923.3125 | 1.61 |
| 44923.322916666664 | 1.65 |
| 44923.333333333336 | 1.55 |
| 44923.34375 | 1.51 |
| 44923.354166666664 | 1.41 |
| 44923.364583333336 | 1.47 |
| 44923.375 | 1.46 |
| 44923.385416666664 | 1.43 |
| 44923.395833333336 | 1.35 |
| 44923.40625 | 1.48 |
| 44923.416666666664 | 1.3 |
| 44923.427083333336 | 1.43 |
| 44923.4375 | 1.39 |
| 44923.447916666664 | 1.39 |
| 44923.458333333336 | 1.45 |
| 44923.46875 | 1.62 |
| 44923.479166666664 | 1.49 |
| 44923.489583333336 | 1.39 |
| 44923.5 | 1.68 |
| 44923.510416666664 | 1.55 |
| 44923.520833333336 | 1.46 |
| 44923.53125 | 1.43 |
| 44923.541666666664 | 1.51 |
| 44923.552083333336 | 1.22 |
| 44923.5625 | 0.95 |
| 44923.572916666664 | 0.88 |
| 44923.583333333336 | 0.76 |
| 44923.59375 | 0.74 |
| 44923.604166666664 | 0.81 |
| 44923.614583333336 | 0.79 |
| 44923.625 | 0.73 |
| 44923.635416666664 | 0.8 |
| 44923.645833333336 | 0.63 |
| 44923.65625 | 0.66 |
| 44923.666666666664 | 0.76 |
| 44923.677083333336 | 0.7 |
| 44923.6875 | 0.71 |
| 44923.697916666664 | 0.74 |
| 44923.708333333336 | 0.69 |
| 44923.71875 | 0.68 |
| 44923.729166666664 | 0.58 |
| 44923.739583333336 | 0.62 |
| 44923.75 | 0.7 |
| 44923.760416666664 | 0.67 |
| 44923.770833333336 | 0.72 |
| 44923.78125 | 0.63 |
| 44923.791666666664 | 0.6 |
| 44923.802083333336 | 0.63 |
| 44923.8125 | 0.76 |
| 44923.822916666664 | 0.84 |
| 44923.833333333336 | 0.72 |
| 44923.84375 | 0.82 |
| 44923.854166666664 | 0.91 |
| 44923.864583333336 | 0.98 |
| 44923.875 | 1.17 |
| 44923.885416666664 | 1.22 |
| 44923.895833333336 | 1.23 |
| 44923.90625 | 1.23 |
| 44923.916666666664 | 1.17 |
| 44923.927083333336 | 1.23 |
| 44923.9375 | 1.35 |
| 44923.947916666664 | 1.27 |
| 44923.958333333336 | 1.31 |
| 44923.96875 | 1.32 |
| 44923.979166666664 | 1.35 |
| 44923.989583333336 | 1.66 |
| 44924.0 | 1.67 |
| 44924.010416666664 | 1.35 |
| 44924.020833333336 | 1.45 |
| 44924.03125 | 1.25 |
| 44924.041666666664 | 1.37 |
| 44924.052083333336 | 1.4 |
| 44924.0625 | 1.47 |
| 44924.072916666664 | 1.48 |
| 44924.083333333336 | 1.43 |
| 44924.09375 | 1.41 |
| 44924.104166666664 | 1.65 |
| 44924.114583333336 | 1.64 |
| 44924.125 | 1.51 |
| 44924.135416666664 | 1.49 |
| 44924.145833333336 | 1.64 |
| 44924.15625 | 1.58 |
| 44924.166666666664 | 1.67 |
| 44924.177083333336 | 1.83 |
| 44924.1875 | 1.73 |
| 44924.197916666664 | 1.65 |
| 44924.208333333336 | 1.65 |
| 44924.21875 | 1.76 |
| 44924.229166666664 | 1.82 |
| 44924.239583333336 | 1.75 |
| 44924.25 | 1.91 |
| 44924.260416666664 | 2.85 |
| 44924.270833333336 | 1.66 |
| 44924.28125 | 1.98 |
| 44924.291666666664 | 1.68 |
| 44924.302083333336 | 1.7 |
| 44924.3125 | 1.83 |
| 44924.322916666664 | 1.59 |
| 44924.333333333336 | 1.69 |
| 44924.34375 | 1.73 |
| 44924.354166666664 | 1.68 |
| 44924.364583333336 | 1.61 |
| 44924.375 | 1.61 |
| 44924.385416666664 | 1.63 |
| 44924.395833333336 | 1.65 |
| 44924.40625 | 1.56 |
| 44924.416666666664 | 1.62 |
| 44924.427083333336 | 1.65 |
| 44924.4375 | 1.55 |
| 44924.447916666664 | 1.55 |
| 44924.458333333336 | 1.48 |
| 44924.46875 | 1.41 |
| 44924.479166666664 | 1.48 |
| 44924.489583333336 | 1.69 |
| 44924.5 | 1.69 |
| 44924.510416666664 | 2.04 |
| 44924.520833333336 | 1.68 |
| 44924.53125 | 1.6 |
| 44924.541666666664 | 1.64 |
| 44924.552083333336 | 1.57 |
| 44924.5625 | 1.14 |
| 44924.572916666664 | 1.1 |
| 44924.583333333336 | 0.87 |
| 44924.59375 | 0.9 |
| 44924.604166666664 | 0.72 |
| 44924.614583333336 | 0.71 |
| 44924.625 | 0.59 |
| 44924.635416666664 | 0.66 |
| 44924.645833333336 | 0.72 |
| 44924.65625 | 0.69 |
| 44924.666666666664 | 0.59 |
| 44924.677083333336 | 0.71 |
| 44924.6875 | 0.72 |
| 44924.697916666664 | 0.62 |
| 44924.708333333336 | 0.6 |
| 44924.71875 | 0.64 |
| 44924.729166666664 | 0.7 |
| 44924.739583333336 | 0.68 |
| 44924.75 | 0.61 |
| 44924.760416666664 | 0.64 |
| 44924.770833333336 | 0.65 |
| 44924.78125 | 0.65 |
| 44924.791666666664 | 0.87 |
| 44924.802083333336 | 0.74 |
| 44924.8125 | 0.71 |
| 44924.822916666664 | 0.74 |
| 44924.833333333336 | 0.66 |
| 44924.84375 | 0.92 |
| 44924.854166666664 | 1.06 |
| 44924.864583333336 | 1.28 |
| 44924.875 | 1.45 |
| 44924.885416666664 | 1.45 |
| 44924.895833333336 | 1.36 |
| 44924.90625 | 1.38 |
| 44924.916666666664 | 1.55 |
| 44924.927083333336 | 1.59 |
| 44924.9375 | 1.51 |
| 44924.947916666664 | 1.66 |
| 44924.958333333336 | 1.53 |
| 44924.96875 | 1.49 |
| 44924.979166666664 | 1.65 |
| 44924.989583333336 | 1.64 |
| 44925.0 | 1.55 |
| 44925.010416666664 | 1.59 |
| 44925.020833333336 | 2.18 |
| 44925.03125 | 1.84 |
| 44925.041666666664 | 1.64 |
| 44925.052083333336 | 1.74 |
| 44925.0625 | 1.7 |
| 44925.072916666664 | 1.71 |
| 44925.083333333336 | 1.68 |
| 44925.09375 | 1.71 |
| 44925.104166666664 | 1.65 |
| 44925.114583333336 | 1.8 |
| 44925.125 | 1.66 |
| 44925.135416666664 | 1.68 |
| 44925.145833333336 | 1.62 |
| 44925.15625 | 1.54 |
| 44925.166666666664 | 1.67 |
| 44925.177083333336 | 1.68 |
| 44925.1875 | 1.74 |
| 44925.197916666664 | 1.72 |
| 44925.208333333336 | 1.76 |
| 44925.21875 | 1.58 |
| 44925.229166666664 | 1.74 |
| 44925.239583333336 | 1.73 |
| 44925.25 | 1.7 |
| 44925.260416666664 | 1.91 |
| 44925.270833333336 | 1.8 |
| 44925.28125 | 1.74 |
| 44925.291666666664 | 1.95 |
| 44925.302083333336 | 2.06 |
| 44925.3125 | 1.88 |
| 44925.322916666664 | 1.73 |
| 44925.333333333336 | 1.82 |
| 44925.34375 | 1.68 |
| 44925.354166666664 | 1.73 |
| 44925.364583333336 | 1.58 |
| 44925.375 | 1.59 |
| 44925.385416666664 | 1.54 |
| 44925.395833333336 | 1.55 |
| 44925.40625 | 1.6 |
| 44925.416666666664 | 1.62 |
| 44925.427083333336 | 1.56 |
| 44925.4375 | 1.62 |
| 44925.447916666664 | 1.67 |
| 44925.458333333336 | 1.55 |
| 44925.46875 | 1.54 |
| 44925.479166666664 | 1.52 |
| 44925.489583333336 | 1.6 |
| 44925.5 | 1.61 |
| 44925.510416666664 | 1.72 |
| 44925.520833333336 | 1.59 |
| 44925.53125 | 1.72 |
| 44925.541666666664 | 1.6 |
| 44925.552083333336 | 1.27 |
| 44925.5625 | 1.16 |
| 44925.572916666664 | 1.2 |
| 44925.583333333336 | 0.93 |
| 44925.59375 | 0.82 |
| 44925.604166666664 | 0.76 |
| 44925.614583333336 | 0.71 |
| 44925.625 | 0.7 |
| 44925.635416666664 | 0.66 |
| 44925.645833333336 | 0.63 |
| 44925.65625 | 0.59 |
| 44925.666666666664 | 0.56 |
| 44925.677083333336 | 0.76 |
| 44925.6875 | 0.59 |
| 44925.697916666664 | 0.59 |
| 44925.708333333336 | 0.61 |
| 44925.71875 | 0.5 |
| 44925.729166666664 | 0.58 |
| 44925.739583333336 | 0.52 |
| 44925.75 | 0.53 |
| 44925.760416666664 | 0.5 |
| 44925.770833333336 | 0.55 |
| 44925.78125 | 0.54 |
| 44925.791666666664 | 0.51 |
| 44925.802083333336 | 0.58 |
| 44925.8125 | 0.67 |
| 44925.822916666664 | 1.21 |
| 44925.833333333336 | 1.27 |
| 44925.84375 | 1.25 |
| 44925.854166666664 | 1.17 |
| 44925.864583333336 | 1.27 |
| 44925.875 | 1.31 |
| 44925.885416666664 | 1.22 |
| 44925.895833333336 | 1.37 |
| 44925.90625 | 1.31 |
| 44925.916666666664 | 1.57 |
| 44925.927083333336 | 1.53 |
| 44925.9375 | 1.43 |
| 44925.947916666664 | 1.58 |
| 44925.958333333336 | 1.47 |
| 44925.96875 | 1.6 |
| 44925.979166666664 | 1.67 |
| 44925.989583333336 | 1.53 |
| 44926.0 | 1.69 |
| 44926.010416666664 | 1.5 |
| 44926.020833333336 | 1.63 |
| 44926.03125 | 1.68 |
| 44926.041666666664 | 1.63 |
| 44926.052083333336 | 1.7 |
| 44926.0625 | 2.12 |
| 44926.072916666664 | 2.25 |
| 44926.083333333336 | 1.75 |
| 44926.09375 | 2.8 |
| 44926.104166666664 | 1.83 |
| 44926.114583333336 | 1.82 |
| 44926.125 | 1.84 |
| 44926.135416666664 | 1.67 |
| 44926.145833333336 | 1.83 |
| 44926.15625 | 1.76 |
| 44926.166666666664 | 1.78 |
| 44926.177083333336 | 1.52 |
| 44926.1875 | 1.44 |
| 44926.197916666664 | 1.37 |
| 44926.208333333336 | 1.39 |
| 44926.21875 | 1.29 |
| 44926.229166666664 | 1.51 |
| 44926.239583333336 | 1.43 |
| 44926.25 | 1.52 |
| 44926.260416666664 | 1.29 |
| 44926.270833333336 | 1.49 |
| 44926.28125 | 1.68 |
| 44926.291666666664 | 1.6 |
| 44926.302083333336 | 1.63 |
| 44926.3125 | 1.72 |
| 44926.322916666664 | 1.79 |
| 44926.333333333336 | 1.86 |
| 44926.34375 | 1.93 |
| 44926.354166666664 | 1.58 |
| 44926.364583333336 | 1.59 |
| 44926.375 | 1.5 |
| 44926.385416666664 | 1.43 |
| 44926.395833333336 | 1.4 |
| 44926.40625 | 1.4 |
| 44926.416666666664 | 1.24 |
| 44926.427083333336 | 1.22 |
| 44926.4375 | 1.39 |
| 44926.447916666664 | 1.28 |
| 44926.458333333336 | 1.14 |
| 44926.46875 | 0.9 |
| 44926.479166666664 | 1.07 |
| 44926.489583333336 | 1.23 |
| 44926.5 | 1.3 |
| 44926.510416666664 | 1.16 |
| 44926.520833333336 | 1.34 |
| 44926.53125 | 1.43 |
| 44926.541666666664 | 1.39 |
| 44926.552083333336 | 1.45 |
| 44926.5625 | 1.51 |
| 44926.572916666664 | 1.46 |
| 44926.583333333336 | 1.81 |
| 44926.59375 | 2.05 |
| 44926.604166666664 | 1.68 |
| 44926.614583333336 | 1.94 |
| 44926.625 | 1.73 |
| 44926.635416666664 | 0.88 |
| 44926.645833333336 | 0.93 |
| 44926.65625 | 1.35 |
| 44926.666666666664 | 1.37 |
| 44926.677083333336 | 1.66 |
| 44926.6875 | 1.24 |
| 44926.697916666664 | 1.24 |
| 44926.708333333336 | 1.29 |
| 44926.71875 | 1.26 |
| 44926.729166666664 | 1.33 |
| 44926.739583333336 | 0.93 |
| 44926.75 | 0.6 |
| 44926.760416666664 | 0.93 |
| 44926.770833333336 | 1 |
| 44926.78125 | 1.08 |
| 44926.791666666664 | 1.05 |
| 44926.802083333336 | 1.06 |
| 44926.8125 | 1.16 |
| 44926.822916666664 | 1.21 |
| 44926.833333333336 | 1.07 |
| 44926.84375 | 1.12 |
| 44926.854166666664 | 1.16 |
| 44926.864583333336 | 1.91 |
| 44926.875 | 1.31 |
| 44926.885416666664 | 1.64 |
| 44926.895833333336 | 1.05 |
| 44926.90625 | 1.19 |
| 44926.916666666664 | 1.1 |
| 44926.927083333336 | 1.18 |
| 44926.9375 | 1.25 |
| 44926.947916666664 | 1.03 |
| 44926.958333333336 | 1.25 |
| 44926.96875 | 1.34 |
| 44926.979166666664 | 1.34 |
| 44926.989583333336 | 1.21 |
| 44927.0 | 1.17 |
| 44927.010416666664 | 1.21 |
| 44927.020833333336 | 1.56 |
| 44927.03125 | 1.24 |
| 44927.041666666664 | 1.67 |
| 44927.052083333336 | 1.92 |
| 44927.0625 | 1.63 |
| 44927.072916666664 | 1.55 |
| 44927.083333333336 | 1.76 |
| 44927.09375 | 1.71 |
| 44927.104166666664 | 2.02 |
| 44927.114583333336 | 1.92 |
| 44927.125 | 1.83 |
| 44927.135416666664 | 1.69 |
| 44927.145833333336 | 2.04 |